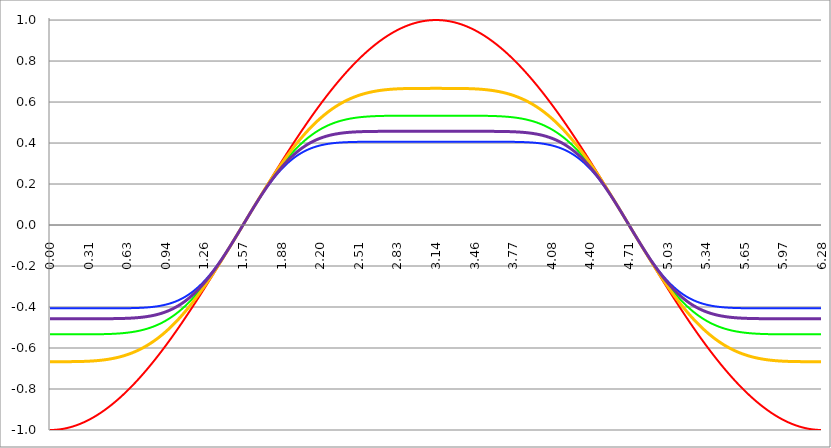
| Category | Series 1 | Series 0 | Series 2 | Series 3 | Series 4 |
|---|---|---|---|---|---|
| 0.0 | -1 | -0.533 | -0.406 | -0.667 | -0.457 |
| 0.00314159265358979 | -1 | -0.533 | -0.406 | -0.667 | -0.457 |
| 0.00628318530717958 | -1 | -0.533 | -0.406 | -0.667 | -0.457 |
| 0.00942477796076938 | -1 | -0.533 | -0.406 | -0.667 | -0.457 |
| 0.0125663706143592 | -1 | -0.533 | -0.406 | -0.667 | -0.457 |
| 0.015707963267949 | -1 | -0.533 | -0.406 | -0.667 | -0.457 |
| 0.0188495559215388 | -1 | -0.533 | -0.406 | -0.667 | -0.457 |
| 0.0219911485751285 | -1 | -0.533 | -0.406 | -0.667 | -0.457 |
| 0.0251327412287183 | -1 | -0.533 | -0.406 | -0.667 | -0.457 |
| 0.0282743338823081 | -1 | -0.533 | -0.406 | -0.667 | -0.457 |
| 0.0314159265358979 | -1 | -0.533 | -0.406 | -0.667 | -0.457 |
| 0.0345575191894877 | -0.999 | -0.533 | -0.406 | -0.667 | -0.457 |
| 0.0376991118430775 | -0.999 | -0.533 | -0.406 | -0.667 | -0.457 |
| 0.0408407044966673 | -0.999 | -0.533 | -0.406 | -0.667 | -0.457 |
| 0.0439822971502571 | -0.999 | -0.533 | -0.406 | -0.667 | -0.457 |
| 0.0471238898038469 | -0.999 | -0.533 | -0.406 | -0.667 | -0.457 |
| 0.0502654824574367 | -0.999 | -0.533 | -0.406 | -0.667 | -0.457 |
| 0.0534070751110265 | -0.999 | -0.533 | -0.406 | -0.667 | -0.457 |
| 0.0565486677646163 | -0.998 | -0.533 | -0.406 | -0.667 | -0.457 |
| 0.059690260418206 | -0.998 | -0.533 | -0.406 | -0.667 | -0.457 |
| 0.0628318530717958 | -0.998 | -0.533 | -0.406 | -0.667 | -0.457 |
| 0.0659734457253856 | -0.998 | -0.533 | -0.406 | -0.667 | -0.457 |
| 0.0691150383789754 | -0.998 | -0.533 | -0.406 | -0.667 | -0.457 |
| 0.0722566310325652 | -0.997 | -0.533 | -0.406 | -0.667 | -0.457 |
| 0.075398223686155 | -0.997 | -0.533 | -0.406 | -0.667 | -0.457 |
| 0.0785398163397448 | -0.997 | -0.533 | -0.406 | -0.667 | -0.457 |
| 0.0816814089933346 | -0.997 | -0.533 | -0.406 | -0.667 | -0.457 |
| 0.0848230016469244 | -0.996 | -0.533 | -0.406 | -0.667 | -0.457 |
| 0.0879645943005142 | -0.996 | -0.533 | -0.406 | -0.667 | -0.457 |
| 0.091106186954104 | -0.996 | -0.533 | -0.406 | -0.667 | -0.457 |
| 0.0942477796076937 | -0.996 | -0.533 | -0.406 | -0.667 | -0.457 |
| 0.0973893722612835 | -0.995 | -0.533 | -0.406 | -0.667 | -0.457 |
| 0.100530964914873 | -0.995 | -0.533 | -0.406 | -0.667 | -0.457 |
| 0.103672557568463 | -0.995 | -0.533 | -0.406 | -0.667 | -0.457 |
| 0.106814150222053 | -0.994 | -0.533 | -0.406 | -0.667 | -0.457 |
| 0.109955742875643 | -0.994 | -0.533 | -0.406 | -0.667 | -0.457 |
| 0.113097335529233 | -0.994 | -0.533 | -0.406 | -0.667 | -0.457 |
| 0.116238928182822 | -0.993 | -0.533 | -0.406 | -0.667 | -0.457 |
| 0.119380520836412 | -0.993 | -0.533 | -0.406 | -0.667 | -0.457 |
| 0.122522113490002 | -0.993 | -0.533 | -0.406 | -0.667 | -0.457 |
| 0.125663706143592 | -0.992 | -0.533 | -0.406 | -0.667 | -0.457 |
| 0.128805298797181 | -0.992 | -0.533 | -0.406 | -0.667 | -0.457 |
| 0.131946891450771 | -0.991 | -0.533 | -0.406 | -0.667 | -0.457 |
| 0.135088484104361 | -0.991 | -0.533 | -0.406 | -0.667 | -0.457 |
| 0.138230076757951 | -0.99 | -0.533 | -0.406 | -0.667 | -0.457 |
| 0.141371669411541 | -0.99 | -0.533 | -0.406 | -0.667 | -0.457 |
| 0.14451326206513 | -0.99 | -0.533 | -0.406 | -0.667 | -0.457 |
| 0.14765485471872 | -0.989 | -0.533 | -0.406 | -0.667 | -0.457 |
| 0.15079644737231 | -0.989 | -0.533 | -0.406 | -0.667 | -0.457 |
| 0.1539380400259 | -0.988 | -0.533 | -0.406 | -0.667 | -0.457 |
| 0.15707963267949 | -0.988 | -0.533 | -0.406 | -0.667 | -0.457 |
| 0.160221225333079 | -0.987 | -0.533 | -0.406 | -0.667 | -0.457 |
| 0.163362817986669 | -0.987 | -0.533 | -0.406 | -0.666 | -0.457 |
| 0.166504410640259 | -0.986 | -0.533 | -0.406 | -0.666 | -0.457 |
| 0.169646003293849 | -0.986 | -0.533 | -0.406 | -0.666 | -0.457 |
| 0.172787595947439 | -0.985 | -0.533 | -0.406 | -0.666 | -0.457 |
| 0.175929188601028 | -0.985 | -0.533 | -0.406 | -0.666 | -0.457 |
| 0.179070781254618 | -0.984 | -0.533 | -0.406 | -0.666 | -0.457 |
| 0.182212373908208 | -0.983 | -0.533 | -0.406 | -0.666 | -0.457 |
| 0.185353966561798 | -0.983 | -0.533 | -0.406 | -0.666 | -0.457 |
| 0.188495559215388 | -0.982 | -0.533 | -0.406 | -0.666 | -0.457 |
| 0.191637151868977 | -0.982 | -0.533 | -0.406 | -0.666 | -0.457 |
| 0.194778744522567 | -0.981 | -0.533 | -0.406 | -0.666 | -0.457 |
| 0.197920337176157 | -0.98 | -0.533 | -0.406 | -0.666 | -0.457 |
| 0.201061929829747 | -0.98 | -0.533 | -0.406 | -0.666 | -0.457 |
| 0.204203522483336 | -0.979 | -0.533 | -0.406 | -0.666 | -0.457 |
| 0.207345115136926 | -0.979 | -0.533 | -0.406 | -0.666 | -0.457 |
| 0.210486707790516 | -0.978 | -0.533 | -0.406 | -0.666 | -0.457 |
| 0.213628300444106 | -0.977 | -0.533 | -0.406 | -0.666 | -0.457 |
| 0.216769893097696 | -0.977 | -0.533 | -0.406 | -0.666 | -0.457 |
| 0.219911485751285 | -0.976 | -0.533 | -0.406 | -0.666 | -0.457 |
| 0.223053078404875 | -0.975 | -0.533 | -0.406 | -0.666 | -0.457 |
| 0.226194671058465 | -0.975 | -0.533 | -0.406 | -0.666 | -0.457 |
| 0.229336263712055 | -0.974 | -0.533 | -0.406 | -0.666 | -0.457 |
| 0.232477856365645 | -0.973 | -0.533 | -0.406 | -0.666 | -0.457 |
| 0.235619449019234 | -0.972 | -0.533 | -0.406 | -0.666 | -0.457 |
| 0.238761041672824 | -0.972 | -0.533 | -0.406 | -0.666 | -0.457 |
| 0.241902634326414 | -0.971 | -0.533 | -0.406 | -0.666 | -0.457 |
| 0.245044226980004 | -0.97 | -0.533 | -0.406 | -0.666 | -0.457 |
| 0.248185819633594 | -0.969 | -0.533 | -0.406 | -0.666 | -0.457 |
| 0.251327412287183 | -0.969 | -0.533 | -0.406 | -0.666 | -0.457 |
| 0.254469004940773 | -0.968 | -0.533 | -0.406 | -0.666 | -0.457 |
| 0.257610597594363 | -0.967 | -0.533 | -0.406 | -0.666 | -0.457 |
| 0.260752190247953 | -0.966 | -0.533 | -0.406 | -0.666 | -0.457 |
| 0.263893782901543 | -0.965 | -0.533 | -0.406 | -0.665 | -0.457 |
| 0.267035375555132 | -0.965 | -0.533 | -0.406 | -0.665 | -0.457 |
| 0.270176968208722 | -0.964 | -0.533 | -0.406 | -0.665 | -0.457 |
| 0.273318560862312 | -0.963 | -0.533 | -0.406 | -0.665 | -0.457 |
| 0.276460153515902 | -0.962 | -0.533 | -0.406 | -0.665 | -0.457 |
| 0.279601746169492 | -0.961 | -0.533 | -0.406 | -0.665 | -0.457 |
| 0.282743338823082 | -0.96 | -0.533 | -0.406 | -0.665 | -0.457 |
| 0.285884931476671 | -0.959 | -0.533 | -0.406 | -0.665 | -0.457 |
| 0.289026524130261 | -0.959 | -0.533 | -0.406 | -0.665 | -0.457 |
| 0.292168116783851 | -0.958 | -0.533 | -0.406 | -0.665 | -0.457 |
| 0.295309709437441 | -0.957 | -0.533 | -0.406 | -0.665 | -0.457 |
| 0.298451302091031 | -0.956 | -0.533 | -0.406 | -0.665 | -0.457 |
| 0.30159289474462 | -0.955 | -0.533 | -0.406 | -0.665 | -0.457 |
| 0.30473448739821 | -0.954 | -0.533 | -0.406 | -0.665 | -0.457 |
| 0.3078760800518 | -0.953 | -0.533 | -0.406 | -0.664 | -0.457 |
| 0.31101767270539 | -0.952 | -0.533 | -0.406 | -0.664 | -0.457 |
| 0.31415926535898 | -0.951 | -0.533 | -0.406 | -0.664 | -0.457 |
| 0.31730085801257 | -0.95 | -0.533 | -0.406 | -0.664 | -0.457 |
| 0.320442450666159 | -0.949 | -0.533 | -0.406 | -0.664 | -0.457 |
| 0.323584043319749 | -0.948 | -0.533 | -0.406 | -0.664 | -0.457 |
| 0.326725635973339 | -0.947 | -0.533 | -0.406 | -0.664 | -0.457 |
| 0.329867228626929 | -0.946 | -0.533 | -0.406 | -0.664 | -0.457 |
| 0.333008821280519 | -0.945 | -0.533 | -0.406 | -0.664 | -0.457 |
| 0.336150413934108 | -0.944 | -0.533 | -0.406 | -0.664 | -0.457 |
| 0.339292006587698 | -0.943 | -0.533 | -0.406 | -0.663 | -0.457 |
| 0.342433599241288 | -0.942 | -0.533 | -0.406 | -0.663 | -0.457 |
| 0.345575191894878 | -0.941 | -0.533 | -0.406 | -0.663 | -0.457 |
| 0.348716784548468 | -0.94 | -0.533 | -0.406 | -0.663 | -0.457 |
| 0.351858377202058 | -0.939 | -0.533 | -0.406 | -0.663 | -0.457 |
| 0.354999969855647 | -0.938 | -0.533 | -0.406 | -0.663 | -0.457 |
| 0.358141562509237 | -0.937 | -0.533 | -0.406 | -0.663 | -0.457 |
| 0.361283155162827 | -0.935 | -0.533 | -0.406 | -0.663 | -0.457 |
| 0.364424747816417 | -0.934 | -0.533 | -0.406 | -0.662 | -0.457 |
| 0.367566340470007 | -0.933 | -0.533 | -0.406 | -0.662 | -0.457 |
| 0.370707933123597 | -0.932 | -0.533 | -0.406 | -0.662 | -0.457 |
| 0.373849525777186 | -0.931 | -0.533 | -0.406 | -0.662 | -0.457 |
| 0.376991118430776 | -0.93 | -0.533 | -0.406 | -0.662 | -0.457 |
| 0.380132711084366 | -0.929 | -0.533 | -0.406 | -0.662 | -0.457 |
| 0.383274303737956 | -0.927 | -0.533 | -0.406 | -0.662 | -0.457 |
| 0.386415896391546 | -0.926 | -0.533 | -0.406 | -0.661 | -0.457 |
| 0.389557489045135 | -0.925 | -0.533 | -0.406 | -0.661 | -0.457 |
| 0.392699081698725 | -0.924 | -0.533 | -0.406 | -0.661 | -0.457 |
| 0.395840674352315 | -0.923 | -0.533 | -0.406 | -0.661 | -0.457 |
| 0.398982267005905 | -0.921 | -0.533 | -0.406 | -0.661 | -0.457 |
| 0.402123859659495 | -0.92 | -0.533 | -0.406 | -0.66 | -0.457 |
| 0.405265452313085 | -0.919 | -0.533 | -0.406 | -0.66 | -0.457 |
| 0.408407044966674 | -0.918 | -0.533 | -0.406 | -0.66 | -0.457 |
| 0.411548637620264 | -0.917 | -0.533 | -0.406 | -0.66 | -0.457 |
| 0.414690230273854 | -0.915 | -0.533 | -0.406 | -0.66 | -0.457 |
| 0.417831822927444 | -0.914 | -0.533 | -0.406 | -0.659 | -0.457 |
| 0.420973415581034 | -0.913 | -0.533 | -0.406 | -0.659 | -0.457 |
| 0.424115008234623 | -0.911 | -0.532 | -0.406 | -0.659 | -0.457 |
| 0.427256600888213 | -0.91 | -0.532 | -0.406 | -0.659 | -0.457 |
| 0.430398193541803 | -0.909 | -0.532 | -0.406 | -0.659 | -0.457 |
| 0.433539786195393 | -0.907 | -0.532 | -0.406 | -0.658 | -0.457 |
| 0.436681378848983 | -0.906 | -0.532 | -0.406 | -0.658 | -0.457 |
| 0.439822971502573 | -0.905 | -0.532 | -0.406 | -0.658 | -0.457 |
| 0.442964564156162 | -0.903 | -0.532 | -0.406 | -0.658 | -0.457 |
| 0.446106156809752 | -0.902 | -0.532 | -0.406 | -0.657 | -0.457 |
| 0.449247749463342 | -0.901 | -0.532 | -0.406 | -0.657 | -0.457 |
| 0.452389342116932 | -0.899 | -0.532 | -0.406 | -0.657 | -0.457 |
| 0.455530934770522 | -0.898 | -0.532 | -0.406 | -0.657 | -0.457 |
| 0.458672527424111 | -0.897 | -0.532 | -0.406 | -0.656 | -0.457 |
| 0.461814120077701 | -0.895 | -0.532 | -0.406 | -0.656 | -0.457 |
| 0.464955712731291 | -0.894 | -0.532 | -0.406 | -0.656 | -0.457 |
| 0.468097305384881 | -0.892 | -0.532 | -0.406 | -0.656 | -0.457 |
| 0.471238898038471 | -0.891 | -0.532 | -0.406 | -0.655 | -0.457 |
| 0.474380490692061 | -0.89 | -0.532 | -0.406 | -0.655 | -0.457 |
| 0.47752208334565 | -0.888 | -0.532 | -0.406 | -0.655 | -0.457 |
| 0.48066367599924 | -0.887 | -0.532 | -0.406 | -0.654 | -0.457 |
| 0.48380526865283 | -0.885 | -0.531 | -0.406 | -0.654 | -0.457 |
| 0.48694686130642 | -0.884 | -0.531 | -0.406 | -0.654 | -0.457 |
| 0.49008845396001 | -0.882 | -0.531 | -0.406 | -0.653 | -0.457 |
| 0.493230046613599 | -0.881 | -0.531 | -0.406 | -0.653 | -0.457 |
| 0.496371639267189 | -0.879 | -0.531 | -0.406 | -0.653 | -0.457 |
| 0.499513231920779 | -0.878 | -0.531 | -0.406 | -0.652 | -0.457 |
| 0.502654824574369 | -0.876 | -0.531 | -0.406 | -0.652 | -0.457 |
| 0.505796417227959 | -0.875 | -0.531 | -0.406 | -0.652 | -0.457 |
| 0.508938009881549 | -0.873 | -0.531 | -0.406 | -0.651 | -0.457 |
| 0.512079602535138 | -0.872 | -0.531 | -0.406 | -0.651 | -0.457 |
| 0.515221195188728 | -0.87 | -0.531 | -0.406 | -0.651 | -0.457 |
| 0.518362787842318 | -0.869 | -0.531 | -0.406 | -0.65 | -0.457 |
| 0.521504380495908 | -0.867 | -0.531 | -0.406 | -0.65 | -0.457 |
| 0.524645973149498 | -0.866 | -0.53 | -0.406 | -0.649 | -0.457 |
| 0.527787565803087 | -0.864 | -0.53 | -0.406 | -0.649 | -0.457 |
| 0.530929158456677 | -0.862 | -0.53 | -0.406 | -0.649 | -0.457 |
| 0.534070751110267 | -0.861 | -0.53 | -0.406 | -0.648 | -0.457 |
| 0.537212343763857 | -0.859 | -0.53 | -0.406 | -0.648 | -0.456 |
| 0.540353936417447 | -0.858 | -0.53 | -0.406 | -0.647 | -0.456 |
| 0.543495529071037 | -0.856 | -0.53 | -0.406 | -0.647 | -0.456 |
| 0.546637121724626 | -0.854 | -0.53 | -0.406 | -0.646 | -0.456 |
| 0.549778714378216 | -0.853 | -0.53 | -0.406 | -0.646 | -0.456 |
| 0.552920307031806 | -0.851 | -0.529 | -0.406 | -0.646 | -0.456 |
| 0.556061899685396 | -0.849 | -0.529 | -0.406 | -0.645 | -0.456 |
| 0.559203492338986 | -0.848 | -0.529 | -0.406 | -0.645 | -0.456 |
| 0.562345084992576 | -0.846 | -0.529 | -0.406 | -0.644 | -0.456 |
| 0.565486677646165 | -0.844 | -0.529 | -0.406 | -0.644 | -0.456 |
| 0.568628270299755 | -0.843 | -0.529 | -0.406 | -0.643 | -0.456 |
| 0.571769862953345 | -0.841 | -0.529 | -0.406 | -0.643 | -0.456 |
| 0.574911455606935 | -0.839 | -0.528 | -0.406 | -0.642 | -0.456 |
| 0.578053048260525 | -0.838 | -0.528 | -0.406 | -0.642 | -0.456 |
| 0.581194640914114 | -0.836 | -0.528 | -0.406 | -0.641 | -0.456 |
| 0.584336233567704 | -0.834 | -0.528 | -0.406 | -0.641 | -0.456 |
| 0.587477826221294 | -0.832 | -0.528 | -0.406 | -0.64 | -0.456 |
| 0.590619418874884 | -0.831 | -0.528 | -0.406 | -0.64 | -0.456 |
| 0.593761011528474 | -0.829 | -0.527 | -0.406 | -0.639 | -0.456 |
| 0.596902604182064 | -0.827 | -0.527 | -0.406 | -0.638 | -0.456 |
| 0.600044196835653 | -0.825 | -0.527 | -0.406 | -0.638 | -0.456 |
| 0.603185789489243 | -0.824 | -0.527 | -0.406 | -0.637 | -0.456 |
| 0.606327382142833 | -0.822 | -0.527 | -0.406 | -0.637 | -0.456 |
| 0.609468974796423 | -0.82 | -0.527 | -0.406 | -0.636 | -0.455 |
| 0.612610567450013 | -0.818 | -0.526 | -0.406 | -0.636 | -0.455 |
| 0.615752160103602 | -0.816 | -0.526 | -0.406 | -0.635 | -0.455 |
| 0.618893752757192 | -0.815 | -0.526 | -0.406 | -0.634 | -0.455 |
| 0.622035345410782 | -0.813 | -0.526 | -0.406 | -0.634 | -0.455 |
| 0.625176938064372 | -0.811 | -0.526 | -0.406 | -0.633 | -0.455 |
| 0.628318530717962 | -0.809 | -0.525 | -0.406 | -0.633 | -0.455 |
| 0.631460123371551 | -0.807 | -0.525 | -0.406 | -0.632 | -0.455 |
| 0.634601716025141 | -0.805 | -0.525 | -0.406 | -0.631 | -0.455 |
| 0.637743308678731 | -0.803 | -0.525 | -0.406 | -0.631 | -0.455 |
| 0.640884901332321 | -0.802 | -0.524 | -0.406 | -0.63 | -0.455 |
| 0.644026493985911 | -0.8 | -0.524 | -0.406 | -0.629 | -0.455 |
| 0.647168086639501 | -0.798 | -0.524 | -0.406 | -0.629 | -0.455 |
| 0.65030967929309 | -0.796 | -0.524 | -0.406 | -0.628 | -0.454 |
| 0.65345127194668 | -0.794 | -0.523 | -0.406 | -0.627 | -0.454 |
| 0.65659286460027 | -0.792 | -0.523 | -0.405 | -0.626 | -0.454 |
| 0.65973445725386 | -0.79 | -0.523 | -0.405 | -0.626 | -0.454 |
| 0.66287604990745 | -0.788 | -0.523 | -0.405 | -0.625 | -0.454 |
| 0.666017642561039 | -0.786 | -0.522 | -0.405 | -0.624 | -0.454 |
| 0.669159235214629 | -0.784 | -0.522 | -0.405 | -0.624 | -0.454 |
| 0.672300827868219 | -0.782 | -0.522 | -0.405 | -0.623 | -0.454 |
| 0.675442420521809 | -0.78 | -0.521 | -0.405 | -0.622 | -0.454 |
| 0.678584013175399 | -0.778 | -0.521 | -0.405 | -0.621 | -0.453 |
| 0.681725605828989 | -0.776 | -0.521 | -0.405 | -0.62 | -0.453 |
| 0.684867198482578 | -0.775 | -0.521 | -0.405 | -0.62 | -0.453 |
| 0.688008791136168 | -0.773 | -0.52 | -0.405 | -0.619 | -0.453 |
| 0.691150383789758 | -0.771 | -0.52 | -0.405 | -0.618 | -0.453 |
| 0.694291976443348 | -0.769 | -0.52 | -0.405 | -0.617 | -0.453 |
| 0.697433569096938 | -0.766 | -0.519 | -0.405 | -0.616 | -0.453 |
| 0.700575161750528 | -0.764 | -0.519 | -0.405 | -0.616 | -0.453 |
| 0.703716754404117 | -0.762 | -0.518 | -0.405 | -0.615 | -0.452 |
| 0.706858347057707 | -0.76 | -0.518 | -0.405 | -0.614 | -0.452 |
| 0.709999939711297 | -0.758 | -0.518 | -0.405 | -0.613 | -0.452 |
| 0.713141532364887 | -0.756 | -0.517 | -0.405 | -0.612 | -0.452 |
| 0.716283125018477 | -0.754 | -0.517 | -0.404 | -0.611 | -0.452 |
| 0.719424717672066 | -0.752 | -0.517 | -0.404 | -0.61 | -0.452 |
| 0.722566310325656 | -0.75 | -0.516 | -0.404 | -0.609 | -0.451 |
| 0.725707902979246 | -0.748 | -0.516 | -0.404 | -0.609 | -0.451 |
| 0.728849495632836 | -0.746 | -0.515 | -0.404 | -0.608 | -0.451 |
| 0.731991088286426 | -0.744 | -0.515 | -0.404 | -0.607 | -0.451 |
| 0.735132680940016 | -0.742 | -0.515 | -0.404 | -0.606 | -0.451 |
| 0.738274273593605 | -0.74 | -0.514 | -0.404 | -0.605 | -0.451 |
| 0.741415866247195 | -0.738 | -0.514 | -0.404 | -0.604 | -0.45 |
| 0.744557458900785 | -0.735 | -0.513 | -0.404 | -0.603 | -0.45 |
| 0.747699051554375 | -0.733 | -0.513 | -0.404 | -0.602 | -0.45 |
| 0.750840644207965 | -0.731 | -0.512 | -0.404 | -0.601 | -0.45 |
| 0.753982236861554 | -0.729 | -0.512 | -0.403 | -0.6 | -0.449 |
| 0.757123829515144 | -0.727 | -0.511 | -0.403 | -0.599 | -0.449 |
| 0.760265422168734 | -0.725 | -0.511 | -0.403 | -0.598 | -0.449 |
| 0.763407014822324 | -0.722 | -0.51 | -0.403 | -0.597 | -0.449 |
| 0.766548607475914 | -0.72 | -0.51 | -0.403 | -0.596 | -0.449 |
| 0.769690200129504 | -0.718 | -0.509 | -0.403 | -0.595 | -0.448 |
| 0.772831792783093 | -0.716 | -0.509 | -0.403 | -0.594 | -0.448 |
| 0.775973385436683 | -0.714 | -0.508 | -0.403 | -0.593 | -0.448 |
| 0.779114978090273 | -0.712 | -0.508 | -0.403 | -0.591 | -0.448 |
| 0.782256570743863 | -0.709 | -0.507 | -0.402 | -0.59 | -0.447 |
| 0.785398163397453 | -0.707 | -0.507 | -0.402 | -0.589 | -0.447 |
| 0.788539756051042 | -0.705 | -0.506 | -0.402 | -0.588 | -0.447 |
| 0.791681348704632 | -0.703 | -0.506 | -0.402 | -0.587 | -0.446 |
| 0.794822941358222 | -0.7 | -0.505 | -0.402 | -0.586 | -0.446 |
| 0.797964534011812 | -0.698 | -0.504 | -0.402 | -0.585 | -0.446 |
| 0.801106126665402 | -0.696 | -0.504 | -0.401 | -0.584 | -0.446 |
| 0.804247719318992 | -0.694 | -0.503 | -0.401 | -0.582 | -0.445 |
| 0.807389311972581 | -0.691 | -0.503 | -0.401 | -0.581 | -0.445 |
| 0.810530904626171 | -0.689 | -0.502 | -0.401 | -0.58 | -0.445 |
| 0.813672497279761 | -0.687 | -0.501 | -0.401 | -0.579 | -0.444 |
| 0.816814089933351 | -0.685 | -0.501 | -0.401 | -0.578 | -0.444 |
| 0.819955682586941 | -0.682 | -0.5 | -0.4 | -0.576 | -0.444 |
| 0.823097275240531 | -0.68 | -0.499 | -0.4 | -0.575 | -0.443 |
| 0.82623886789412 | -0.678 | -0.499 | -0.4 | -0.574 | -0.443 |
| 0.82938046054771 | -0.675 | -0.498 | -0.4 | -0.573 | -0.442 |
| 0.8325220532013 | -0.673 | -0.497 | -0.4 | -0.571 | -0.442 |
| 0.83566364585489 | -0.671 | -0.497 | -0.399 | -0.57 | -0.442 |
| 0.83880523850848 | -0.668 | -0.496 | -0.399 | -0.569 | -0.441 |
| 0.841946831162069 | -0.666 | -0.495 | -0.399 | -0.568 | -0.441 |
| 0.845088423815659 | -0.664 | -0.495 | -0.399 | -0.566 | -0.441 |
| 0.848230016469249 | -0.661 | -0.494 | -0.399 | -0.565 | -0.44 |
| 0.851371609122839 | -0.659 | -0.493 | -0.398 | -0.564 | -0.44 |
| 0.854513201776429 | -0.657 | -0.492 | -0.398 | -0.562 | -0.439 |
| 0.857654794430019 | -0.654 | -0.492 | -0.398 | -0.561 | -0.439 |
| 0.860796387083608 | -0.652 | -0.491 | -0.398 | -0.56 | -0.438 |
| 0.863937979737198 | -0.649 | -0.49 | -0.397 | -0.558 | -0.438 |
| 0.867079572390788 | -0.647 | -0.489 | -0.397 | -0.557 | -0.437 |
| 0.870221165044378 | -0.645 | -0.488 | -0.397 | -0.555 | -0.437 |
| 0.873362757697968 | -0.642 | -0.487 | -0.396 | -0.554 | -0.436 |
| 0.876504350351557 | -0.64 | -0.487 | -0.396 | -0.553 | -0.436 |
| 0.879645943005147 | -0.637 | -0.486 | -0.396 | -0.551 | -0.435 |
| 0.882787535658737 | -0.635 | -0.485 | -0.396 | -0.55 | -0.435 |
| 0.885929128312327 | -0.633 | -0.484 | -0.395 | -0.548 | -0.434 |
| 0.889070720965917 | -0.63 | -0.483 | -0.395 | -0.547 | -0.434 |
| 0.892212313619507 | -0.628 | -0.482 | -0.395 | -0.545 | -0.433 |
| 0.895353906273096 | -0.625 | -0.481 | -0.394 | -0.544 | -0.433 |
| 0.898495498926686 | -0.623 | -0.48 | -0.394 | -0.542 | -0.432 |
| 0.901637091580276 | -0.62 | -0.48 | -0.394 | -0.541 | -0.432 |
| 0.904778684233866 | -0.618 | -0.479 | -0.393 | -0.539 | -0.431 |
| 0.907920276887456 | -0.615 | -0.478 | -0.393 | -0.538 | -0.431 |
| 0.911061869541045 | -0.613 | -0.477 | -0.392 | -0.536 | -0.43 |
| 0.914203462194635 | -0.61 | -0.476 | -0.392 | -0.535 | -0.429 |
| 0.917345054848225 | -0.608 | -0.475 | -0.392 | -0.533 | -0.429 |
| 0.920486647501815 | -0.605 | -0.474 | -0.391 | -0.531 | -0.428 |
| 0.923628240155405 | -0.603 | -0.473 | -0.391 | -0.53 | -0.427 |
| 0.926769832808995 | -0.6 | -0.472 | -0.391 | -0.528 | -0.427 |
| 0.929911425462584 | -0.598 | -0.471 | -0.39 | -0.527 | -0.426 |
| 0.933053018116174 | -0.595 | -0.47 | -0.39 | -0.525 | -0.425 |
| 0.936194610769764 | -0.593 | -0.469 | -0.389 | -0.523 | -0.425 |
| 0.939336203423354 | -0.59 | -0.468 | -0.389 | -0.522 | -0.424 |
| 0.942477796076944 | -0.588 | -0.466 | -0.388 | -0.52 | -0.423 |
| 0.945619388730533 | -0.585 | -0.465 | -0.388 | -0.518 | -0.423 |
| 0.948760981384123 | -0.583 | -0.464 | -0.387 | -0.517 | -0.422 |
| 0.951902574037713 | -0.58 | -0.463 | -0.387 | -0.515 | -0.421 |
| 0.955044166691303 | -0.578 | -0.462 | -0.386 | -0.513 | -0.42 |
| 0.958185759344893 | -0.575 | -0.461 | -0.386 | -0.512 | -0.42 |
| 0.961327351998483 | -0.572 | -0.46 | -0.385 | -0.51 | -0.419 |
| 0.964468944652072 | -0.57 | -0.459 | -0.385 | -0.508 | -0.418 |
| 0.967610537305662 | -0.567 | -0.457 | -0.384 | -0.506 | -0.417 |
| 0.970752129959252 | -0.565 | -0.456 | -0.384 | -0.505 | -0.416 |
| 0.973893722612842 | -0.562 | -0.455 | -0.383 | -0.503 | -0.416 |
| 0.977035315266432 | -0.559 | -0.454 | -0.383 | -0.501 | -0.415 |
| 0.980176907920022 | -0.557 | -0.452 | -0.382 | -0.499 | -0.414 |
| 0.983318500573611 | -0.554 | -0.451 | -0.381 | -0.498 | -0.413 |
| 0.986460093227201 | -0.552 | -0.45 | -0.381 | -0.496 | -0.412 |
| 0.989601685880791 | -0.549 | -0.449 | -0.38 | -0.494 | -0.411 |
| 0.992743278534381 | -0.546 | -0.447 | -0.38 | -0.492 | -0.41 |
| 0.995884871187971 | -0.544 | -0.446 | -0.379 | -0.49 | -0.409 |
| 0.99902646384156 | -0.541 | -0.445 | -0.378 | -0.488 | -0.409 |
| 1.00216805649515 | -0.538 | -0.443 | -0.378 | -0.486 | -0.408 |
| 1.00530964914874 | -0.536 | -0.442 | -0.377 | -0.485 | -0.407 |
| 1.00845124180233 | -0.533 | -0.441 | -0.376 | -0.483 | -0.406 |
| 1.01159283445592 | -0.531 | -0.439 | -0.375 | -0.481 | -0.405 |
| 1.01473442710951 | -0.528 | -0.438 | -0.375 | -0.479 | -0.404 |
| 1.017876019763099 | -0.525 | -0.437 | -0.374 | -0.477 | -0.403 |
| 1.021017612416689 | -0.522 | -0.435 | -0.373 | -0.475 | -0.402 |
| 1.02415920507028 | -0.52 | -0.434 | -0.373 | -0.473 | -0.401 |
| 1.027300797723869 | -0.517 | -0.432 | -0.372 | -0.471 | -0.4 |
| 1.030442390377459 | -0.514 | -0.431 | -0.371 | -0.469 | -0.399 |
| 1.033583983031048 | -0.512 | -0.429 | -0.37 | -0.467 | -0.397 |
| 1.036725575684638 | -0.509 | -0.428 | -0.369 | -0.465 | -0.396 |
| 1.039867168338228 | -0.506 | -0.426 | -0.369 | -0.463 | -0.395 |
| 1.043008760991818 | -0.504 | -0.425 | -0.368 | -0.461 | -0.394 |
| 1.046150353645408 | -0.501 | -0.423 | -0.367 | -0.459 | -0.393 |
| 1.049291946298998 | -0.498 | -0.422 | -0.366 | -0.457 | -0.392 |
| 1.052433538952587 | -0.495 | -0.42 | -0.365 | -0.455 | -0.391 |
| 1.055575131606177 | -0.493 | -0.419 | -0.364 | -0.453 | -0.39 |
| 1.058716724259767 | -0.49 | -0.417 | -0.363 | -0.451 | -0.388 |
| 1.061858316913357 | -0.487 | -0.416 | -0.362 | -0.449 | -0.387 |
| 1.064999909566947 | -0.485 | -0.414 | -0.361 | -0.447 | -0.386 |
| 1.068141502220536 | -0.482 | -0.412 | -0.361 | -0.444 | -0.385 |
| 1.071283094874126 | -0.479 | -0.411 | -0.36 | -0.442 | -0.383 |
| 1.074424687527716 | -0.476 | -0.409 | -0.359 | -0.44 | -0.382 |
| 1.077566280181306 | -0.473 | -0.407 | -0.358 | -0.438 | -0.381 |
| 1.080707872834896 | -0.471 | -0.406 | -0.357 | -0.436 | -0.38 |
| 1.083849465488486 | -0.468 | -0.404 | -0.356 | -0.434 | -0.378 |
| 1.086991058142075 | -0.465 | -0.402 | -0.355 | -0.432 | -0.377 |
| 1.090132650795665 | -0.462 | -0.401 | -0.353 | -0.429 | -0.376 |
| 1.093274243449255 | -0.46 | -0.399 | -0.352 | -0.427 | -0.374 |
| 1.096415836102845 | -0.457 | -0.397 | -0.351 | -0.425 | -0.373 |
| 1.099557428756435 | -0.454 | -0.395 | -0.35 | -0.423 | -0.371 |
| 1.102699021410025 | -0.451 | -0.394 | -0.349 | -0.421 | -0.37 |
| 1.105840614063614 | -0.448 | -0.392 | -0.348 | -0.418 | -0.369 |
| 1.108982206717204 | -0.446 | -0.39 | -0.347 | -0.416 | -0.367 |
| 1.112123799370794 | -0.443 | -0.388 | -0.346 | -0.414 | -0.366 |
| 1.115265392024384 | -0.44 | -0.386 | -0.344 | -0.412 | -0.364 |
| 1.118406984677974 | -0.437 | -0.385 | -0.343 | -0.409 | -0.363 |
| 1.121548577331563 | -0.434 | -0.383 | -0.342 | -0.407 | -0.361 |
| 1.124690169985153 | -0.431 | -0.381 | -0.341 | -0.405 | -0.36 |
| 1.127831762638743 | -0.429 | -0.379 | -0.34 | -0.402 | -0.358 |
| 1.130973355292333 | -0.426 | -0.377 | -0.338 | -0.4 | -0.357 |
| 1.134114947945923 | -0.423 | -0.375 | -0.337 | -0.398 | -0.355 |
| 1.137256540599513 | -0.42 | -0.373 | -0.336 | -0.395 | -0.353 |
| 1.140398133253102 | -0.417 | -0.371 | -0.334 | -0.393 | -0.352 |
| 1.143539725906692 | -0.414 | -0.369 | -0.333 | -0.391 | -0.35 |
| 1.146681318560282 | -0.412 | -0.367 | -0.332 | -0.388 | -0.349 |
| 1.149822911213872 | -0.409 | -0.365 | -0.33 | -0.386 | -0.347 |
| 1.152964503867462 | -0.406 | -0.363 | -0.329 | -0.384 | -0.345 |
| 1.156106096521051 | -0.403 | -0.361 | -0.327 | -0.381 | -0.344 |
| 1.159247689174641 | -0.4 | -0.359 | -0.326 | -0.379 | -0.342 |
| 1.162389281828231 | -0.397 | -0.357 | -0.325 | -0.376 | -0.34 |
| 1.165530874481821 | -0.394 | -0.355 | -0.323 | -0.374 | -0.338 |
| 1.168672467135411 | -0.391 | -0.353 | -0.322 | -0.371 | -0.337 |
| 1.171814059789001 | -0.388 | -0.351 | -0.32 | -0.369 | -0.335 |
| 1.17495565244259 | -0.386 | -0.349 | -0.319 | -0.366 | -0.333 |
| 1.17809724509618 | -0.383 | -0.347 | -0.317 | -0.364 | -0.331 |
| 1.18123883774977 | -0.38 | -0.345 | -0.316 | -0.362 | -0.33 |
| 1.18438043040336 | -0.377 | -0.343 | -0.314 | -0.359 | -0.328 |
| 1.18752202305695 | -0.374 | -0.341 | -0.312 | -0.357 | -0.326 |
| 1.190663615710539 | -0.371 | -0.338 | -0.311 | -0.354 | -0.324 |
| 1.193805208364129 | -0.368 | -0.336 | -0.309 | -0.351 | -0.322 |
| 1.19694680101772 | -0.365 | -0.334 | -0.308 | -0.349 | -0.32 |
| 1.200088393671309 | -0.362 | -0.332 | -0.306 | -0.346 | -0.318 |
| 1.203229986324899 | -0.359 | -0.33 | -0.304 | -0.344 | -0.316 |
| 1.206371578978489 | -0.356 | -0.327 | -0.303 | -0.341 | -0.314 |
| 1.209513171632078 | -0.353 | -0.325 | -0.301 | -0.339 | -0.313 |
| 1.212654764285668 | -0.351 | -0.323 | -0.299 | -0.336 | -0.311 |
| 1.215796356939258 | -0.348 | -0.321 | -0.297 | -0.334 | -0.309 |
| 1.218937949592848 | -0.345 | -0.318 | -0.296 | -0.331 | -0.307 |
| 1.222079542246438 | -0.342 | -0.316 | -0.294 | -0.328 | -0.305 |
| 1.225221134900027 | -0.339 | -0.314 | -0.292 | -0.326 | -0.302 |
| 1.228362727553617 | -0.336 | -0.311 | -0.29 | -0.323 | -0.3 |
| 1.231504320207207 | -0.333 | -0.309 | -0.288 | -0.321 | -0.298 |
| 1.234645912860797 | -0.33 | -0.307 | -0.286 | -0.318 | -0.296 |
| 1.237787505514387 | -0.327 | -0.304 | -0.285 | -0.315 | -0.294 |
| 1.240929098167977 | -0.324 | -0.302 | -0.283 | -0.313 | -0.292 |
| 1.244070690821566 | -0.321 | -0.3 | -0.281 | -0.31 | -0.29 |
| 1.247212283475156 | -0.318 | -0.297 | -0.279 | -0.307 | -0.288 |
| 1.250353876128746 | -0.315 | -0.295 | -0.277 | -0.305 | -0.286 |
| 1.253495468782336 | -0.312 | -0.292 | -0.275 | -0.302 | -0.283 |
| 1.256637061435926 | -0.309 | -0.29 | -0.273 | -0.299 | -0.281 |
| 1.259778654089515 | -0.306 | -0.287 | -0.271 | -0.296 | -0.279 |
| 1.262920246743105 | -0.303 | -0.285 | -0.269 | -0.294 | -0.277 |
| 1.266061839396695 | -0.3 | -0.283 | -0.267 | -0.291 | -0.274 |
| 1.269203432050285 | -0.297 | -0.28 | -0.265 | -0.288 | -0.272 |
| 1.272345024703875 | -0.294 | -0.278 | -0.263 | -0.286 | -0.27 |
| 1.275486617357465 | -0.291 | -0.275 | -0.261 | -0.283 | -0.268 |
| 1.278628210011054 | -0.288 | -0.272 | -0.258 | -0.28 | -0.265 |
| 1.281769802664644 | -0.285 | -0.27 | -0.256 | -0.277 | -0.263 |
| 1.284911395318234 | -0.282 | -0.267 | -0.254 | -0.275 | -0.261 |
| 1.288052987971824 | -0.279 | -0.265 | -0.252 | -0.272 | -0.258 |
| 1.291194580625414 | -0.276 | -0.262 | -0.25 | -0.269 | -0.256 |
| 1.294336173279003 | -0.273 | -0.26 | -0.248 | -0.266 | -0.254 |
| 1.297477765932593 | -0.27 | -0.257 | -0.245 | -0.263 | -0.251 |
| 1.300619358586183 | -0.267 | -0.254 | -0.243 | -0.261 | -0.249 |
| 1.303760951239773 | -0.264 | -0.252 | -0.241 | -0.258 | -0.246 |
| 1.306902543893363 | -0.261 | -0.249 | -0.239 | -0.255 | -0.244 |
| 1.310044136546953 | -0.258 | -0.247 | -0.236 | -0.252 | -0.241 |
| 1.313185729200542 | -0.255 | -0.244 | -0.234 | -0.249 | -0.239 |
| 1.316327321854132 | -0.252 | -0.241 | -0.232 | -0.246 | -0.236 |
| 1.319468914507722 | -0.249 | -0.239 | -0.229 | -0.244 | -0.234 |
| 1.322610507161312 | -0.246 | -0.236 | -0.227 | -0.241 | -0.231 |
| 1.325752099814902 | -0.243 | -0.233 | -0.225 | -0.238 | -0.229 |
| 1.328893692468491 | -0.24 | -0.231 | -0.222 | -0.235 | -0.226 |
| 1.332035285122081 | -0.236 | -0.228 | -0.22 | -0.232 | -0.224 |
| 1.335176877775671 | -0.233 | -0.225 | -0.217 | -0.229 | -0.221 |
| 1.338318470429261 | -0.23 | -0.222 | -0.215 | -0.226 | -0.219 |
| 1.341460063082851 | -0.227 | -0.22 | -0.212 | -0.223 | -0.216 |
| 1.344601655736441 | -0.224 | -0.217 | -0.21 | -0.221 | -0.213 |
| 1.34774324839003 | -0.221 | -0.214 | -0.207 | -0.218 | -0.211 |
| 1.35088484104362 | -0.218 | -0.211 | -0.205 | -0.215 | -0.208 |
| 1.35402643369721 | -0.215 | -0.209 | -0.202 | -0.212 | -0.205 |
| 1.3571680263508 | -0.212 | -0.206 | -0.2 | -0.209 | -0.203 |
| 1.36030961900439 | -0.209 | -0.203 | -0.197 | -0.206 | -0.2 |
| 1.363451211657979 | -0.206 | -0.2 | -0.195 | -0.203 | -0.197 |
| 1.36659280431157 | -0.203 | -0.197 | -0.192 | -0.2 | -0.195 |
| 1.369734396965159 | -0.2 | -0.194 | -0.189 | -0.197 | -0.192 |
| 1.372875989618749 | -0.197 | -0.192 | -0.187 | -0.194 | -0.189 |
| 1.376017582272339 | -0.194 | -0.189 | -0.184 | -0.191 | -0.186 |
| 1.379159174925929 | -0.19 | -0.186 | -0.182 | -0.188 | -0.184 |
| 1.382300767579518 | -0.187 | -0.183 | -0.179 | -0.185 | -0.181 |
| 1.385442360233108 | -0.184 | -0.18 | -0.176 | -0.182 | -0.178 |
| 1.388583952886698 | -0.181 | -0.177 | -0.174 | -0.179 | -0.175 |
| 1.391725545540288 | -0.178 | -0.174 | -0.171 | -0.176 | -0.173 |
| 1.394867138193878 | -0.175 | -0.171 | -0.168 | -0.173 | -0.17 |
| 1.398008730847468 | -0.172 | -0.169 | -0.165 | -0.17 | -0.167 |
| 1.401150323501057 | -0.169 | -0.166 | -0.163 | -0.167 | -0.164 |
| 1.404291916154647 | -0.166 | -0.163 | -0.16 | -0.164 | -0.161 |
| 1.407433508808237 | -0.163 | -0.16 | -0.157 | -0.161 | -0.158 |
| 1.410575101461827 | -0.16 | -0.157 | -0.154 | -0.158 | -0.156 |
| 1.413716694115417 | -0.156 | -0.154 | -0.151 | -0.155 | -0.153 |
| 1.416858286769006 | -0.153 | -0.151 | -0.149 | -0.152 | -0.15 |
| 1.419999879422596 | -0.15 | -0.148 | -0.146 | -0.149 | -0.147 |
| 1.423141472076186 | -0.147 | -0.145 | -0.143 | -0.146 | -0.144 |
| 1.426283064729776 | -0.144 | -0.142 | -0.14 | -0.143 | -0.141 |
| 1.429424657383366 | -0.141 | -0.139 | -0.137 | -0.14 | -0.138 |
| 1.432566250036956 | -0.138 | -0.136 | -0.134 | -0.137 | -0.135 |
| 1.435707842690545 | -0.135 | -0.133 | -0.131 | -0.134 | -0.132 |
| 1.438849435344135 | -0.132 | -0.13 | -0.129 | -0.131 | -0.129 |
| 1.441991027997725 | -0.128 | -0.127 | -0.126 | -0.128 | -0.126 |
| 1.445132620651315 | -0.125 | -0.124 | -0.123 | -0.125 | -0.123 |
| 1.448274213304905 | -0.122 | -0.121 | -0.12 | -0.122 | -0.12 |
| 1.451415805958494 | -0.119 | -0.118 | -0.117 | -0.119 | -0.117 |
| 1.454557398612084 | -0.116 | -0.115 | -0.114 | -0.115 | -0.114 |
| 1.457698991265674 | -0.113 | -0.112 | -0.111 | -0.112 | -0.111 |
| 1.460840583919264 | -0.11 | -0.109 | -0.108 | -0.109 | -0.108 |
| 1.463982176572854 | -0.107 | -0.106 | -0.105 | -0.106 | -0.105 |
| 1.467123769226444 | -0.103 | -0.103 | -0.102 | -0.103 | -0.102 |
| 1.470265361880033 | -0.1 | -0.1 | -0.099 | -0.1 | -0.099 |
| 1.473406954533623 | -0.097 | -0.097 | -0.096 | -0.097 | -0.096 |
| 1.476548547187213 | -0.094 | -0.094 | -0.093 | -0.094 | -0.093 |
| 1.479690139840803 | -0.091 | -0.09 | -0.09 | -0.091 | -0.09 |
| 1.482831732494393 | -0.088 | -0.087 | -0.087 | -0.088 | -0.087 |
| 1.485973325147982 | -0.085 | -0.084 | -0.084 | -0.085 | -0.084 |
| 1.489114917801572 | -0.082 | -0.081 | -0.081 | -0.081 | -0.081 |
| 1.492256510455162 | -0.078 | -0.078 | -0.078 | -0.078 | -0.078 |
| 1.495398103108752 | -0.075 | -0.075 | -0.075 | -0.075 | -0.075 |
| 1.498539695762342 | -0.072 | -0.072 | -0.072 | -0.072 | -0.072 |
| 1.501681288415932 | -0.069 | -0.069 | -0.069 | -0.069 | -0.069 |
| 1.504822881069521 | -0.066 | -0.066 | -0.066 | -0.066 | -0.066 |
| 1.507964473723111 | -0.063 | -0.063 | -0.062 | -0.063 | -0.063 |
| 1.511106066376701 | -0.06 | -0.06 | -0.059 | -0.06 | -0.059 |
| 1.514247659030291 | -0.057 | -0.056 | -0.056 | -0.056 | -0.056 |
| 1.517389251683881 | -0.053 | -0.053 | -0.053 | -0.053 | -0.053 |
| 1.520530844337471 | -0.05 | -0.05 | -0.05 | -0.05 | -0.05 |
| 1.52367243699106 | -0.047 | -0.047 | -0.047 | -0.047 | -0.047 |
| 1.52681402964465 | -0.044 | -0.044 | -0.044 | -0.044 | -0.044 |
| 1.52995562229824 | -0.041 | -0.041 | -0.041 | -0.041 | -0.041 |
| 1.53309721495183 | -0.038 | -0.038 | -0.038 | -0.038 | -0.038 |
| 1.53623880760542 | -0.035 | -0.035 | -0.034 | -0.035 | -0.035 |
| 1.539380400259009 | -0.031 | -0.031 | -0.031 | -0.031 | -0.031 |
| 1.542521992912599 | -0.028 | -0.028 | -0.028 | -0.028 | -0.028 |
| 1.545663585566189 | -0.025 | -0.025 | -0.025 | -0.025 | -0.025 |
| 1.548805178219779 | -0.022 | -0.022 | -0.022 | -0.022 | -0.022 |
| 1.551946770873369 | -0.019 | -0.019 | -0.019 | -0.019 | -0.019 |
| 1.555088363526959 | -0.016 | -0.016 | -0.016 | -0.016 | -0.016 |
| 1.558229956180548 | -0.013 | -0.013 | -0.013 | -0.013 | -0.013 |
| 1.561371548834138 | -0.009 | -0.009 | -0.009 | -0.009 | -0.009 |
| 1.564513141487728 | -0.006 | -0.006 | -0.006 | -0.006 | -0.006 |
| 1.567654734141318 | -0.003 | -0.003 | -0.003 | -0.003 | -0.003 |
| 1.570796326794908 | 0 | 0 | 0 | 0 | 0 |
| 1.573937919448497 | 0.003 | 0.003 | 0.003 | 0.003 | 0.003 |
| 1.577079512102087 | 0.006 | 0.006 | 0.006 | 0.006 | 0.006 |
| 1.580221104755677 | 0.009 | 0.009 | 0.009 | 0.009 | 0.009 |
| 1.583362697409267 | 0.013 | 0.013 | 0.013 | 0.013 | 0.013 |
| 1.586504290062857 | 0.016 | 0.016 | 0.016 | 0.016 | 0.016 |
| 1.589645882716447 | 0.019 | 0.019 | 0.019 | 0.019 | 0.019 |
| 1.592787475370036 | 0.022 | 0.022 | 0.022 | 0.022 | 0.022 |
| 1.595929068023626 | 0.025 | 0.025 | 0.025 | 0.025 | 0.025 |
| 1.599070660677216 | 0.028 | 0.028 | 0.028 | 0.028 | 0.028 |
| 1.602212253330806 | 0.031 | 0.031 | 0.031 | 0.031 | 0.031 |
| 1.605353845984396 | 0.035 | 0.035 | 0.034 | 0.035 | 0.035 |
| 1.608495438637985 | 0.038 | 0.038 | 0.038 | 0.038 | 0.038 |
| 1.611637031291575 | 0.041 | 0.041 | 0.041 | 0.041 | 0.041 |
| 1.614778623945165 | 0.044 | 0.044 | 0.044 | 0.044 | 0.044 |
| 1.617920216598755 | 0.047 | 0.047 | 0.047 | 0.047 | 0.047 |
| 1.621061809252345 | 0.05 | 0.05 | 0.05 | 0.05 | 0.05 |
| 1.624203401905935 | 0.053 | 0.053 | 0.053 | 0.053 | 0.053 |
| 1.627344994559524 | 0.057 | 0.056 | 0.056 | 0.056 | 0.056 |
| 1.630486587213114 | 0.06 | 0.06 | 0.059 | 0.06 | 0.059 |
| 1.633628179866704 | 0.063 | 0.063 | 0.062 | 0.063 | 0.063 |
| 1.636769772520294 | 0.066 | 0.066 | 0.066 | 0.066 | 0.066 |
| 1.639911365173884 | 0.069 | 0.069 | 0.069 | 0.069 | 0.069 |
| 1.643052957827473 | 0.072 | 0.072 | 0.072 | 0.072 | 0.072 |
| 1.646194550481063 | 0.075 | 0.075 | 0.075 | 0.075 | 0.075 |
| 1.649336143134653 | 0.078 | 0.078 | 0.078 | 0.078 | 0.078 |
| 1.652477735788243 | 0.082 | 0.081 | 0.081 | 0.081 | 0.081 |
| 1.655619328441833 | 0.085 | 0.084 | 0.084 | 0.085 | 0.084 |
| 1.658760921095423 | 0.088 | 0.087 | 0.087 | 0.088 | 0.087 |
| 1.661902513749012 | 0.091 | 0.09 | 0.09 | 0.091 | 0.09 |
| 1.665044106402602 | 0.094 | 0.094 | 0.093 | 0.094 | 0.093 |
| 1.668185699056192 | 0.097 | 0.097 | 0.096 | 0.097 | 0.096 |
| 1.671327291709782 | 0.1 | 0.1 | 0.099 | 0.1 | 0.099 |
| 1.674468884363372 | 0.103 | 0.103 | 0.102 | 0.103 | 0.102 |
| 1.677610477016961 | 0.107 | 0.106 | 0.105 | 0.106 | 0.105 |
| 1.680752069670551 | 0.11 | 0.109 | 0.108 | 0.109 | 0.108 |
| 1.683893662324141 | 0.113 | 0.112 | 0.111 | 0.112 | 0.111 |
| 1.687035254977731 | 0.116 | 0.115 | 0.114 | 0.115 | 0.114 |
| 1.690176847631321 | 0.119 | 0.118 | 0.117 | 0.119 | 0.117 |
| 1.693318440284911 | 0.122 | 0.121 | 0.12 | 0.122 | 0.12 |
| 1.6964600329385 | 0.125 | 0.124 | 0.123 | 0.125 | 0.123 |
| 1.69960162559209 | 0.128 | 0.127 | 0.126 | 0.128 | 0.126 |
| 1.70274321824568 | 0.132 | 0.13 | 0.129 | 0.131 | 0.129 |
| 1.70588481089927 | 0.135 | 0.133 | 0.131 | 0.134 | 0.132 |
| 1.70902640355286 | 0.138 | 0.136 | 0.134 | 0.137 | 0.135 |
| 1.712167996206449 | 0.141 | 0.139 | 0.137 | 0.14 | 0.138 |
| 1.715309588860039 | 0.144 | 0.142 | 0.14 | 0.143 | 0.141 |
| 1.71845118151363 | 0.147 | 0.145 | 0.143 | 0.146 | 0.144 |
| 1.721592774167219 | 0.15 | 0.148 | 0.146 | 0.149 | 0.147 |
| 1.724734366820809 | 0.153 | 0.151 | 0.149 | 0.152 | 0.15 |
| 1.727875959474399 | 0.156 | 0.154 | 0.151 | 0.155 | 0.153 |
| 1.731017552127988 | 0.16 | 0.157 | 0.154 | 0.158 | 0.156 |
| 1.734159144781578 | 0.163 | 0.16 | 0.157 | 0.161 | 0.158 |
| 1.737300737435168 | 0.166 | 0.163 | 0.16 | 0.164 | 0.161 |
| 1.740442330088758 | 0.169 | 0.166 | 0.163 | 0.167 | 0.164 |
| 1.743583922742348 | 0.172 | 0.169 | 0.165 | 0.17 | 0.167 |
| 1.746725515395937 | 0.175 | 0.171 | 0.168 | 0.173 | 0.17 |
| 1.749867108049527 | 0.178 | 0.174 | 0.171 | 0.176 | 0.173 |
| 1.753008700703117 | 0.181 | 0.177 | 0.174 | 0.179 | 0.175 |
| 1.756150293356707 | 0.184 | 0.18 | 0.176 | 0.182 | 0.178 |
| 1.759291886010297 | 0.187 | 0.183 | 0.179 | 0.185 | 0.181 |
| 1.762433478663887 | 0.19 | 0.186 | 0.182 | 0.188 | 0.184 |
| 1.765575071317476 | 0.194 | 0.189 | 0.184 | 0.191 | 0.186 |
| 1.768716663971066 | 0.197 | 0.192 | 0.187 | 0.194 | 0.189 |
| 1.771858256624656 | 0.2 | 0.194 | 0.189 | 0.197 | 0.192 |
| 1.774999849278246 | 0.203 | 0.197 | 0.192 | 0.2 | 0.195 |
| 1.778141441931836 | 0.206 | 0.2 | 0.195 | 0.203 | 0.197 |
| 1.781283034585426 | 0.209 | 0.203 | 0.197 | 0.206 | 0.2 |
| 1.784424627239015 | 0.212 | 0.206 | 0.2 | 0.209 | 0.203 |
| 1.787566219892605 | 0.215 | 0.209 | 0.202 | 0.212 | 0.205 |
| 1.790707812546195 | 0.218 | 0.211 | 0.205 | 0.215 | 0.208 |
| 1.793849405199785 | 0.221 | 0.214 | 0.207 | 0.218 | 0.211 |
| 1.796990997853375 | 0.224 | 0.217 | 0.21 | 0.221 | 0.213 |
| 1.800132590506964 | 0.227 | 0.22 | 0.212 | 0.223 | 0.216 |
| 1.803274183160554 | 0.23 | 0.222 | 0.215 | 0.226 | 0.219 |
| 1.806415775814144 | 0.233 | 0.225 | 0.217 | 0.229 | 0.221 |
| 1.809557368467734 | 0.236 | 0.228 | 0.22 | 0.232 | 0.224 |
| 1.812698961121324 | 0.24 | 0.231 | 0.222 | 0.235 | 0.226 |
| 1.815840553774914 | 0.243 | 0.233 | 0.225 | 0.238 | 0.229 |
| 1.818982146428503 | 0.246 | 0.236 | 0.227 | 0.241 | 0.231 |
| 1.822123739082093 | 0.249 | 0.239 | 0.229 | 0.244 | 0.234 |
| 1.825265331735683 | 0.252 | 0.241 | 0.232 | 0.246 | 0.236 |
| 1.828406924389273 | 0.255 | 0.244 | 0.234 | 0.249 | 0.239 |
| 1.831548517042863 | 0.258 | 0.247 | 0.236 | 0.252 | 0.241 |
| 1.834690109696452 | 0.261 | 0.249 | 0.239 | 0.255 | 0.244 |
| 1.837831702350042 | 0.264 | 0.252 | 0.241 | 0.258 | 0.246 |
| 1.840973295003632 | 0.267 | 0.254 | 0.243 | 0.261 | 0.249 |
| 1.844114887657222 | 0.27 | 0.257 | 0.245 | 0.263 | 0.251 |
| 1.847256480310812 | 0.273 | 0.26 | 0.248 | 0.266 | 0.254 |
| 1.850398072964402 | 0.276 | 0.262 | 0.25 | 0.269 | 0.256 |
| 1.853539665617991 | 0.279 | 0.265 | 0.252 | 0.272 | 0.258 |
| 1.856681258271581 | 0.282 | 0.267 | 0.254 | 0.275 | 0.261 |
| 1.859822850925171 | 0.285 | 0.27 | 0.256 | 0.277 | 0.263 |
| 1.862964443578761 | 0.288 | 0.272 | 0.258 | 0.28 | 0.265 |
| 1.866106036232351 | 0.291 | 0.275 | 0.261 | 0.283 | 0.268 |
| 1.86924762888594 | 0.294 | 0.278 | 0.263 | 0.286 | 0.27 |
| 1.87238922153953 | 0.297 | 0.28 | 0.265 | 0.288 | 0.272 |
| 1.87553081419312 | 0.3 | 0.283 | 0.267 | 0.291 | 0.274 |
| 1.87867240684671 | 0.303 | 0.285 | 0.269 | 0.294 | 0.277 |
| 1.8818139995003 | 0.306 | 0.287 | 0.271 | 0.296 | 0.279 |
| 1.88495559215389 | 0.309 | 0.29 | 0.273 | 0.299 | 0.281 |
| 1.888097184807479 | 0.312 | 0.292 | 0.275 | 0.302 | 0.283 |
| 1.891238777461069 | 0.315 | 0.295 | 0.277 | 0.305 | 0.286 |
| 1.89438037011466 | 0.318 | 0.297 | 0.279 | 0.307 | 0.288 |
| 1.897521962768249 | 0.321 | 0.3 | 0.281 | 0.31 | 0.29 |
| 1.900663555421839 | 0.324 | 0.302 | 0.283 | 0.313 | 0.292 |
| 1.903805148075429 | 0.327 | 0.304 | 0.285 | 0.315 | 0.294 |
| 1.906946740729018 | 0.33 | 0.307 | 0.286 | 0.318 | 0.296 |
| 1.910088333382608 | 0.333 | 0.309 | 0.288 | 0.321 | 0.298 |
| 1.913229926036198 | 0.336 | 0.311 | 0.29 | 0.323 | 0.3 |
| 1.916371518689788 | 0.339 | 0.314 | 0.292 | 0.326 | 0.302 |
| 1.919513111343378 | 0.342 | 0.316 | 0.294 | 0.328 | 0.305 |
| 1.922654703996967 | 0.345 | 0.318 | 0.296 | 0.331 | 0.307 |
| 1.925796296650557 | 0.348 | 0.321 | 0.297 | 0.334 | 0.309 |
| 1.928937889304147 | 0.351 | 0.323 | 0.299 | 0.336 | 0.311 |
| 1.932079481957737 | 0.353 | 0.325 | 0.301 | 0.339 | 0.313 |
| 1.935221074611327 | 0.356 | 0.327 | 0.303 | 0.341 | 0.314 |
| 1.938362667264917 | 0.359 | 0.33 | 0.304 | 0.344 | 0.316 |
| 1.941504259918506 | 0.362 | 0.332 | 0.306 | 0.346 | 0.318 |
| 1.944645852572096 | 0.365 | 0.334 | 0.308 | 0.349 | 0.32 |
| 1.947787445225686 | 0.368 | 0.336 | 0.309 | 0.351 | 0.322 |
| 1.950929037879276 | 0.371 | 0.338 | 0.311 | 0.354 | 0.324 |
| 1.954070630532866 | 0.374 | 0.341 | 0.312 | 0.357 | 0.326 |
| 1.957212223186455 | 0.377 | 0.343 | 0.314 | 0.359 | 0.328 |
| 1.960353815840045 | 0.38 | 0.345 | 0.316 | 0.362 | 0.33 |
| 1.963495408493635 | 0.383 | 0.347 | 0.317 | 0.364 | 0.331 |
| 1.966637001147225 | 0.386 | 0.349 | 0.319 | 0.366 | 0.333 |
| 1.969778593800815 | 0.388 | 0.351 | 0.32 | 0.369 | 0.335 |
| 1.972920186454405 | 0.391 | 0.353 | 0.322 | 0.371 | 0.337 |
| 1.976061779107994 | 0.394 | 0.355 | 0.323 | 0.374 | 0.338 |
| 1.979203371761584 | 0.397 | 0.357 | 0.325 | 0.376 | 0.34 |
| 1.982344964415174 | 0.4 | 0.359 | 0.326 | 0.379 | 0.342 |
| 1.985486557068764 | 0.403 | 0.361 | 0.327 | 0.381 | 0.344 |
| 1.988628149722354 | 0.406 | 0.363 | 0.329 | 0.384 | 0.345 |
| 1.991769742375943 | 0.409 | 0.365 | 0.33 | 0.386 | 0.347 |
| 1.994911335029533 | 0.412 | 0.367 | 0.332 | 0.388 | 0.349 |
| 1.998052927683123 | 0.414 | 0.369 | 0.333 | 0.391 | 0.35 |
| 2.001194520336712 | 0.417 | 0.371 | 0.334 | 0.393 | 0.352 |
| 2.004336112990302 | 0.42 | 0.373 | 0.336 | 0.395 | 0.353 |
| 2.007477705643892 | 0.423 | 0.375 | 0.337 | 0.398 | 0.355 |
| 2.010619298297482 | 0.426 | 0.377 | 0.338 | 0.4 | 0.357 |
| 2.013760890951071 | 0.429 | 0.379 | 0.34 | 0.402 | 0.358 |
| 2.016902483604661 | 0.431 | 0.381 | 0.341 | 0.405 | 0.36 |
| 2.02004407625825 | 0.434 | 0.383 | 0.342 | 0.407 | 0.361 |
| 2.02318566891184 | 0.437 | 0.385 | 0.343 | 0.409 | 0.363 |
| 2.02632726156543 | 0.44 | 0.386 | 0.344 | 0.412 | 0.364 |
| 2.029468854219019 | 0.443 | 0.388 | 0.346 | 0.414 | 0.366 |
| 2.032610446872609 | 0.446 | 0.39 | 0.347 | 0.416 | 0.367 |
| 2.035752039526198 | 0.448 | 0.392 | 0.348 | 0.418 | 0.369 |
| 2.038893632179788 | 0.451 | 0.394 | 0.349 | 0.421 | 0.37 |
| 2.042035224833378 | 0.454 | 0.395 | 0.35 | 0.423 | 0.371 |
| 2.045176817486967 | 0.457 | 0.397 | 0.351 | 0.425 | 0.373 |
| 2.048318410140557 | 0.46 | 0.399 | 0.352 | 0.427 | 0.374 |
| 2.051460002794146 | 0.462 | 0.401 | 0.353 | 0.429 | 0.376 |
| 2.054601595447736 | 0.465 | 0.402 | 0.355 | 0.432 | 0.377 |
| 2.057743188101325 | 0.468 | 0.404 | 0.356 | 0.434 | 0.378 |
| 2.060884780754915 | 0.471 | 0.406 | 0.357 | 0.436 | 0.38 |
| 2.064026373408505 | 0.473 | 0.407 | 0.358 | 0.438 | 0.381 |
| 2.067167966062094 | 0.476 | 0.409 | 0.359 | 0.44 | 0.382 |
| 2.070309558715684 | 0.479 | 0.411 | 0.36 | 0.442 | 0.383 |
| 2.073451151369273 | 0.482 | 0.412 | 0.361 | 0.444 | 0.385 |
| 2.076592744022863 | 0.485 | 0.414 | 0.361 | 0.447 | 0.386 |
| 2.079734336676452 | 0.487 | 0.416 | 0.362 | 0.449 | 0.387 |
| 2.082875929330042 | 0.49 | 0.417 | 0.363 | 0.451 | 0.388 |
| 2.086017521983632 | 0.493 | 0.419 | 0.364 | 0.453 | 0.39 |
| 2.089159114637221 | 0.495 | 0.42 | 0.365 | 0.455 | 0.391 |
| 2.092300707290811 | 0.498 | 0.422 | 0.366 | 0.457 | 0.392 |
| 2.095442299944401 | 0.501 | 0.423 | 0.367 | 0.459 | 0.393 |
| 2.09858389259799 | 0.504 | 0.425 | 0.368 | 0.461 | 0.394 |
| 2.10172548525158 | 0.506 | 0.426 | 0.369 | 0.463 | 0.395 |
| 2.104867077905169 | 0.509 | 0.428 | 0.369 | 0.465 | 0.396 |
| 2.108008670558759 | 0.512 | 0.429 | 0.37 | 0.467 | 0.397 |
| 2.111150263212349 | 0.514 | 0.431 | 0.371 | 0.469 | 0.399 |
| 2.114291855865938 | 0.517 | 0.432 | 0.372 | 0.471 | 0.4 |
| 2.117433448519528 | 0.52 | 0.434 | 0.373 | 0.473 | 0.401 |
| 2.120575041173117 | 0.522 | 0.435 | 0.373 | 0.475 | 0.402 |
| 2.123716633826707 | 0.525 | 0.437 | 0.374 | 0.477 | 0.403 |
| 2.126858226480297 | 0.528 | 0.438 | 0.375 | 0.479 | 0.404 |
| 2.129999819133886 | 0.531 | 0.439 | 0.375 | 0.481 | 0.405 |
| 2.133141411787476 | 0.533 | 0.441 | 0.376 | 0.483 | 0.406 |
| 2.136283004441065 | 0.536 | 0.442 | 0.377 | 0.485 | 0.407 |
| 2.139424597094655 | 0.538 | 0.443 | 0.378 | 0.486 | 0.408 |
| 2.142566189748245 | 0.541 | 0.445 | 0.378 | 0.488 | 0.409 |
| 2.145707782401834 | 0.544 | 0.446 | 0.379 | 0.49 | 0.409 |
| 2.148849375055424 | 0.546 | 0.447 | 0.38 | 0.492 | 0.41 |
| 2.151990967709013 | 0.549 | 0.449 | 0.38 | 0.494 | 0.411 |
| 2.155132560362603 | 0.552 | 0.45 | 0.381 | 0.496 | 0.412 |
| 2.158274153016193 | 0.554 | 0.451 | 0.381 | 0.498 | 0.413 |
| 2.161415745669782 | 0.557 | 0.452 | 0.382 | 0.499 | 0.414 |
| 2.164557338323372 | 0.559 | 0.454 | 0.383 | 0.501 | 0.415 |
| 2.167698930976961 | 0.562 | 0.455 | 0.383 | 0.503 | 0.416 |
| 2.170840523630551 | 0.565 | 0.456 | 0.384 | 0.505 | 0.416 |
| 2.173982116284141 | 0.567 | 0.457 | 0.384 | 0.506 | 0.417 |
| 2.17712370893773 | 0.57 | 0.459 | 0.385 | 0.508 | 0.418 |
| 2.18026530159132 | 0.572 | 0.46 | 0.385 | 0.51 | 0.419 |
| 2.183406894244909 | 0.575 | 0.461 | 0.386 | 0.512 | 0.42 |
| 2.186548486898499 | 0.578 | 0.462 | 0.386 | 0.513 | 0.42 |
| 2.189690079552089 | 0.58 | 0.463 | 0.387 | 0.515 | 0.421 |
| 2.192831672205678 | 0.583 | 0.464 | 0.387 | 0.517 | 0.422 |
| 2.195973264859268 | 0.585 | 0.465 | 0.388 | 0.518 | 0.423 |
| 2.199114857512857 | 0.588 | 0.466 | 0.388 | 0.52 | 0.423 |
| 2.202256450166447 | 0.59 | 0.468 | 0.389 | 0.522 | 0.424 |
| 2.205398042820036 | 0.593 | 0.469 | 0.389 | 0.523 | 0.425 |
| 2.208539635473626 | 0.595 | 0.47 | 0.39 | 0.525 | 0.425 |
| 2.211681228127216 | 0.598 | 0.471 | 0.39 | 0.527 | 0.426 |
| 2.214822820780805 | 0.6 | 0.472 | 0.391 | 0.528 | 0.427 |
| 2.217964413434395 | 0.603 | 0.473 | 0.391 | 0.53 | 0.427 |
| 2.221106006087984 | 0.605 | 0.474 | 0.391 | 0.531 | 0.428 |
| 2.224247598741574 | 0.608 | 0.475 | 0.392 | 0.533 | 0.429 |
| 2.227389191395164 | 0.61 | 0.476 | 0.392 | 0.535 | 0.429 |
| 2.230530784048753 | 0.613 | 0.477 | 0.392 | 0.536 | 0.43 |
| 2.233672376702343 | 0.615 | 0.478 | 0.393 | 0.538 | 0.431 |
| 2.236813969355933 | 0.618 | 0.479 | 0.393 | 0.539 | 0.431 |
| 2.239955562009522 | 0.62 | 0.48 | 0.394 | 0.541 | 0.432 |
| 2.243097154663112 | 0.623 | 0.48 | 0.394 | 0.542 | 0.432 |
| 2.246238747316701 | 0.625 | 0.481 | 0.394 | 0.544 | 0.433 |
| 2.249380339970291 | 0.628 | 0.482 | 0.395 | 0.545 | 0.433 |
| 2.252521932623881 | 0.63 | 0.483 | 0.395 | 0.547 | 0.434 |
| 2.25566352527747 | 0.633 | 0.484 | 0.395 | 0.548 | 0.434 |
| 2.25880511793106 | 0.635 | 0.485 | 0.396 | 0.55 | 0.435 |
| 2.261946710584649 | 0.637 | 0.486 | 0.396 | 0.551 | 0.435 |
| 2.265088303238239 | 0.64 | 0.487 | 0.396 | 0.553 | 0.436 |
| 2.268229895891829 | 0.642 | 0.487 | 0.396 | 0.554 | 0.436 |
| 2.271371488545418 | 0.645 | 0.488 | 0.397 | 0.555 | 0.437 |
| 2.274513081199008 | 0.647 | 0.489 | 0.397 | 0.557 | 0.437 |
| 2.277654673852597 | 0.649 | 0.49 | 0.397 | 0.558 | 0.438 |
| 2.280796266506186 | 0.652 | 0.491 | 0.398 | 0.56 | 0.438 |
| 2.283937859159776 | 0.654 | 0.492 | 0.398 | 0.561 | 0.439 |
| 2.287079451813366 | 0.657 | 0.492 | 0.398 | 0.562 | 0.439 |
| 2.290221044466955 | 0.659 | 0.493 | 0.398 | 0.564 | 0.44 |
| 2.293362637120545 | 0.661 | 0.494 | 0.399 | 0.565 | 0.44 |
| 2.296504229774135 | 0.664 | 0.495 | 0.399 | 0.566 | 0.441 |
| 2.299645822427724 | 0.666 | 0.495 | 0.399 | 0.568 | 0.441 |
| 2.302787415081314 | 0.668 | 0.496 | 0.399 | 0.569 | 0.441 |
| 2.305929007734904 | 0.671 | 0.497 | 0.399 | 0.57 | 0.442 |
| 2.309070600388493 | 0.673 | 0.497 | 0.4 | 0.571 | 0.442 |
| 2.312212193042083 | 0.675 | 0.498 | 0.4 | 0.573 | 0.442 |
| 2.315353785695672 | 0.678 | 0.499 | 0.4 | 0.574 | 0.443 |
| 2.318495378349262 | 0.68 | 0.499 | 0.4 | 0.575 | 0.443 |
| 2.321636971002852 | 0.682 | 0.5 | 0.4 | 0.576 | 0.444 |
| 2.324778563656441 | 0.685 | 0.501 | 0.401 | 0.578 | 0.444 |
| 2.327920156310031 | 0.687 | 0.501 | 0.401 | 0.579 | 0.444 |
| 2.33106174896362 | 0.689 | 0.502 | 0.401 | 0.58 | 0.445 |
| 2.33420334161721 | 0.691 | 0.503 | 0.401 | 0.581 | 0.445 |
| 2.3373449342708 | 0.694 | 0.503 | 0.401 | 0.582 | 0.445 |
| 2.340486526924389 | 0.696 | 0.504 | 0.401 | 0.584 | 0.446 |
| 2.343628119577979 | 0.698 | 0.504 | 0.402 | 0.585 | 0.446 |
| 2.346769712231568 | 0.7 | 0.505 | 0.402 | 0.586 | 0.446 |
| 2.349911304885158 | 0.703 | 0.506 | 0.402 | 0.587 | 0.446 |
| 2.353052897538748 | 0.705 | 0.506 | 0.402 | 0.588 | 0.447 |
| 2.356194490192337 | 0.707 | 0.507 | 0.402 | 0.589 | 0.447 |
| 2.359336082845927 | 0.709 | 0.507 | 0.402 | 0.59 | 0.447 |
| 2.362477675499516 | 0.712 | 0.508 | 0.403 | 0.591 | 0.448 |
| 2.365619268153106 | 0.714 | 0.508 | 0.403 | 0.593 | 0.448 |
| 2.368760860806696 | 0.716 | 0.509 | 0.403 | 0.594 | 0.448 |
| 2.371902453460285 | 0.718 | 0.509 | 0.403 | 0.595 | 0.448 |
| 2.375044046113875 | 0.72 | 0.51 | 0.403 | 0.596 | 0.449 |
| 2.378185638767464 | 0.722 | 0.51 | 0.403 | 0.597 | 0.449 |
| 2.381327231421054 | 0.725 | 0.511 | 0.403 | 0.598 | 0.449 |
| 2.384468824074644 | 0.727 | 0.511 | 0.403 | 0.599 | 0.449 |
| 2.387610416728233 | 0.729 | 0.512 | 0.403 | 0.6 | 0.449 |
| 2.390752009381823 | 0.731 | 0.512 | 0.404 | 0.601 | 0.45 |
| 2.393893602035412 | 0.733 | 0.513 | 0.404 | 0.602 | 0.45 |
| 2.397035194689002 | 0.735 | 0.513 | 0.404 | 0.603 | 0.45 |
| 2.400176787342591 | 0.738 | 0.514 | 0.404 | 0.604 | 0.45 |
| 2.403318379996181 | 0.74 | 0.514 | 0.404 | 0.605 | 0.451 |
| 2.406459972649771 | 0.742 | 0.515 | 0.404 | 0.606 | 0.451 |
| 2.40960156530336 | 0.744 | 0.515 | 0.404 | 0.607 | 0.451 |
| 2.41274315795695 | 0.746 | 0.515 | 0.404 | 0.608 | 0.451 |
| 2.41588475061054 | 0.748 | 0.516 | 0.404 | 0.609 | 0.451 |
| 2.419026343264129 | 0.75 | 0.516 | 0.404 | 0.609 | 0.451 |
| 2.422167935917719 | 0.752 | 0.517 | 0.404 | 0.61 | 0.452 |
| 2.425309528571308 | 0.754 | 0.517 | 0.404 | 0.611 | 0.452 |
| 2.428451121224898 | 0.756 | 0.517 | 0.405 | 0.612 | 0.452 |
| 2.431592713878488 | 0.758 | 0.518 | 0.405 | 0.613 | 0.452 |
| 2.434734306532077 | 0.76 | 0.518 | 0.405 | 0.614 | 0.452 |
| 2.437875899185667 | 0.762 | 0.518 | 0.405 | 0.615 | 0.452 |
| 2.441017491839256 | 0.764 | 0.519 | 0.405 | 0.616 | 0.453 |
| 2.444159084492846 | 0.766 | 0.519 | 0.405 | 0.616 | 0.453 |
| 2.447300677146435 | 0.769 | 0.52 | 0.405 | 0.617 | 0.453 |
| 2.450442269800025 | 0.771 | 0.52 | 0.405 | 0.618 | 0.453 |
| 2.453583862453615 | 0.773 | 0.52 | 0.405 | 0.619 | 0.453 |
| 2.456725455107204 | 0.775 | 0.521 | 0.405 | 0.62 | 0.453 |
| 2.459867047760794 | 0.776 | 0.521 | 0.405 | 0.62 | 0.453 |
| 2.463008640414384 | 0.778 | 0.521 | 0.405 | 0.621 | 0.453 |
| 2.466150233067973 | 0.78 | 0.521 | 0.405 | 0.622 | 0.454 |
| 2.469291825721563 | 0.782 | 0.522 | 0.405 | 0.623 | 0.454 |
| 2.472433418375152 | 0.784 | 0.522 | 0.405 | 0.624 | 0.454 |
| 2.475575011028742 | 0.786 | 0.522 | 0.405 | 0.624 | 0.454 |
| 2.478716603682332 | 0.788 | 0.523 | 0.405 | 0.625 | 0.454 |
| 2.481858196335921 | 0.79 | 0.523 | 0.405 | 0.626 | 0.454 |
| 2.48499978898951 | 0.792 | 0.523 | 0.405 | 0.626 | 0.454 |
| 2.4881413816431 | 0.794 | 0.523 | 0.406 | 0.627 | 0.454 |
| 2.49128297429669 | 0.796 | 0.524 | 0.406 | 0.628 | 0.454 |
| 2.49442456695028 | 0.798 | 0.524 | 0.406 | 0.629 | 0.455 |
| 2.497566159603869 | 0.8 | 0.524 | 0.406 | 0.629 | 0.455 |
| 2.500707752257458 | 0.802 | 0.524 | 0.406 | 0.63 | 0.455 |
| 2.503849344911048 | 0.803 | 0.525 | 0.406 | 0.631 | 0.455 |
| 2.506990937564638 | 0.805 | 0.525 | 0.406 | 0.631 | 0.455 |
| 2.510132530218228 | 0.807 | 0.525 | 0.406 | 0.632 | 0.455 |
| 2.513274122871817 | 0.809 | 0.525 | 0.406 | 0.633 | 0.455 |
| 2.516415715525407 | 0.811 | 0.526 | 0.406 | 0.633 | 0.455 |
| 2.519557308178996 | 0.813 | 0.526 | 0.406 | 0.634 | 0.455 |
| 2.522698900832586 | 0.815 | 0.526 | 0.406 | 0.634 | 0.455 |
| 2.525840493486176 | 0.816 | 0.526 | 0.406 | 0.635 | 0.455 |
| 2.528982086139765 | 0.818 | 0.526 | 0.406 | 0.636 | 0.455 |
| 2.532123678793355 | 0.82 | 0.527 | 0.406 | 0.636 | 0.455 |
| 2.535265271446944 | 0.822 | 0.527 | 0.406 | 0.637 | 0.456 |
| 2.538406864100534 | 0.824 | 0.527 | 0.406 | 0.637 | 0.456 |
| 2.541548456754124 | 0.825 | 0.527 | 0.406 | 0.638 | 0.456 |
| 2.544690049407713 | 0.827 | 0.527 | 0.406 | 0.638 | 0.456 |
| 2.547831642061302 | 0.829 | 0.527 | 0.406 | 0.639 | 0.456 |
| 2.550973234714892 | 0.831 | 0.528 | 0.406 | 0.64 | 0.456 |
| 2.554114827368482 | 0.832 | 0.528 | 0.406 | 0.64 | 0.456 |
| 2.557256420022072 | 0.834 | 0.528 | 0.406 | 0.641 | 0.456 |
| 2.560398012675661 | 0.836 | 0.528 | 0.406 | 0.641 | 0.456 |
| 2.563539605329251 | 0.838 | 0.528 | 0.406 | 0.642 | 0.456 |
| 2.56668119798284 | 0.839 | 0.528 | 0.406 | 0.642 | 0.456 |
| 2.56982279063643 | 0.841 | 0.529 | 0.406 | 0.643 | 0.456 |
| 2.57296438329002 | 0.843 | 0.529 | 0.406 | 0.643 | 0.456 |
| 2.576105975943609 | 0.844 | 0.529 | 0.406 | 0.644 | 0.456 |
| 2.579247568597199 | 0.846 | 0.529 | 0.406 | 0.644 | 0.456 |
| 2.582389161250788 | 0.848 | 0.529 | 0.406 | 0.645 | 0.456 |
| 2.585530753904377 | 0.849 | 0.529 | 0.406 | 0.645 | 0.456 |
| 2.588672346557967 | 0.851 | 0.529 | 0.406 | 0.646 | 0.456 |
| 2.591813939211557 | 0.853 | 0.53 | 0.406 | 0.646 | 0.456 |
| 2.594955531865147 | 0.854 | 0.53 | 0.406 | 0.646 | 0.456 |
| 2.598097124518736 | 0.856 | 0.53 | 0.406 | 0.647 | 0.456 |
| 2.601238717172326 | 0.858 | 0.53 | 0.406 | 0.647 | 0.456 |
| 2.604380309825915 | 0.859 | 0.53 | 0.406 | 0.648 | 0.456 |
| 2.607521902479505 | 0.861 | 0.53 | 0.406 | 0.648 | 0.457 |
| 2.610663495133095 | 0.862 | 0.53 | 0.406 | 0.649 | 0.457 |
| 2.613805087786684 | 0.864 | 0.53 | 0.406 | 0.649 | 0.457 |
| 2.616946680440274 | 0.866 | 0.53 | 0.406 | 0.649 | 0.457 |
| 2.620088273093863 | 0.867 | 0.531 | 0.406 | 0.65 | 0.457 |
| 2.623229865747452 | 0.869 | 0.531 | 0.406 | 0.65 | 0.457 |
| 2.626371458401042 | 0.87 | 0.531 | 0.406 | 0.651 | 0.457 |
| 2.629513051054632 | 0.872 | 0.531 | 0.406 | 0.651 | 0.457 |
| 2.632654643708222 | 0.873 | 0.531 | 0.406 | 0.651 | 0.457 |
| 2.635796236361811 | 0.875 | 0.531 | 0.406 | 0.652 | 0.457 |
| 2.638937829015401 | 0.876 | 0.531 | 0.406 | 0.652 | 0.457 |
| 2.642079421668991 | 0.878 | 0.531 | 0.406 | 0.652 | 0.457 |
| 2.64522101432258 | 0.879 | 0.531 | 0.406 | 0.653 | 0.457 |
| 2.64836260697617 | 0.881 | 0.531 | 0.406 | 0.653 | 0.457 |
| 2.651504199629759 | 0.882 | 0.531 | 0.406 | 0.653 | 0.457 |
| 2.654645792283349 | 0.884 | 0.531 | 0.406 | 0.654 | 0.457 |
| 2.657787384936938 | 0.885 | 0.531 | 0.406 | 0.654 | 0.457 |
| 2.660928977590528 | 0.887 | 0.532 | 0.406 | 0.654 | 0.457 |
| 2.664070570244118 | 0.888 | 0.532 | 0.406 | 0.655 | 0.457 |
| 2.667212162897707 | 0.89 | 0.532 | 0.406 | 0.655 | 0.457 |
| 2.670353755551297 | 0.891 | 0.532 | 0.406 | 0.655 | 0.457 |
| 2.673495348204887 | 0.892 | 0.532 | 0.406 | 0.656 | 0.457 |
| 2.676636940858476 | 0.894 | 0.532 | 0.406 | 0.656 | 0.457 |
| 2.679778533512066 | 0.895 | 0.532 | 0.406 | 0.656 | 0.457 |
| 2.682920126165655 | 0.897 | 0.532 | 0.406 | 0.656 | 0.457 |
| 2.686061718819245 | 0.898 | 0.532 | 0.406 | 0.657 | 0.457 |
| 2.689203311472835 | 0.899 | 0.532 | 0.406 | 0.657 | 0.457 |
| 2.692344904126424 | 0.901 | 0.532 | 0.406 | 0.657 | 0.457 |
| 2.695486496780014 | 0.902 | 0.532 | 0.406 | 0.657 | 0.457 |
| 2.698628089433603 | 0.903 | 0.532 | 0.406 | 0.658 | 0.457 |
| 2.701769682087193 | 0.905 | 0.532 | 0.406 | 0.658 | 0.457 |
| 2.704911274740782 | 0.906 | 0.532 | 0.406 | 0.658 | 0.457 |
| 2.708052867394372 | 0.907 | 0.532 | 0.406 | 0.658 | 0.457 |
| 2.711194460047962 | 0.909 | 0.532 | 0.406 | 0.659 | 0.457 |
| 2.714336052701551 | 0.91 | 0.532 | 0.406 | 0.659 | 0.457 |
| 2.717477645355141 | 0.911 | 0.532 | 0.406 | 0.659 | 0.457 |
| 2.720619238008731 | 0.913 | 0.533 | 0.406 | 0.659 | 0.457 |
| 2.72376083066232 | 0.914 | 0.533 | 0.406 | 0.659 | 0.457 |
| 2.72690242331591 | 0.915 | 0.533 | 0.406 | 0.66 | 0.457 |
| 2.730044015969499 | 0.917 | 0.533 | 0.406 | 0.66 | 0.457 |
| 2.733185608623089 | 0.918 | 0.533 | 0.406 | 0.66 | 0.457 |
| 2.736327201276678 | 0.919 | 0.533 | 0.406 | 0.66 | 0.457 |
| 2.739468793930268 | 0.92 | 0.533 | 0.406 | 0.66 | 0.457 |
| 2.742610386583858 | 0.921 | 0.533 | 0.406 | 0.661 | 0.457 |
| 2.745751979237447 | 0.923 | 0.533 | 0.406 | 0.661 | 0.457 |
| 2.748893571891036 | 0.924 | 0.533 | 0.406 | 0.661 | 0.457 |
| 2.752035164544627 | 0.925 | 0.533 | 0.406 | 0.661 | 0.457 |
| 2.755176757198216 | 0.926 | 0.533 | 0.406 | 0.661 | 0.457 |
| 2.758318349851806 | 0.927 | 0.533 | 0.406 | 0.662 | 0.457 |
| 2.761459942505395 | 0.929 | 0.533 | 0.406 | 0.662 | 0.457 |
| 2.764601535158985 | 0.93 | 0.533 | 0.406 | 0.662 | 0.457 |
| 2.767743127812574 | 0.931 | 0.533 | 0.406 | 0.662 | 0.457 |
| 2.770884720466164 | 0.932 | 0.533 | 0.406 | 0.662 | 0.457 |
| 2.774026313119754 | 0.933 | 0.533 | 0.406 | 0.662 | 0.457 |
| 2.777167905773343 | 0.934 | 0.533 | 0.406 | 0.662 | 0.457 |
| 2.780309498426932 | 0.935 | 0.533 | 0.406 | 0.663 | 0.457 |
| 2.783451091080522 | 0.937 | 0.533 | 0.406 | 0.663 | 0.457 |
| 2.786592683734112 | 0.938 | 0.533 | 0.406 | 0.663 | 0.457 |
| 2.789734276387701 | 0.939 | 0.533 | 0.406 | 0.663 | 0.457 |
| 2.792875869041291 | 0.94 | 0.533 | 0.406 | 0.663 | 0.457 |
| 2.796017461694881 | 0.941 | 0.533 | 0.406 | 0.663 | 0.457 |
| 2.79915905434847 | 0.942 | 0.533 | 0.406 | 0.663 | 0.457 |
| 2.80230064700206 | 0.943 | 0.533 | 0.406 | 0.663 | 0.457 |
| 2.80544223965565 | 0.944 | 0.533 | 0.406 | 0.664 | 0.457 |
| 2.808583832309239 | 0.945 | 0.533 | 0.406 | 0.664 | 0.457 |
| 2.811725424962829 | 0.946 | 0.533 | 0.406 | 0.664 | 0.457 |
| 2.814867017616419 | 0.947 | 0.533 | 0.406 | 0.664 | 0.457 |
| 2.818008610270008 | 0.948 | 0.533 | 0.406 | 0.664 | 0.457 |
| 2.821150202923598 | 0.949 | 0.533 | 0.406 | 0.664 | 0.457 |
| 2.824291795577187 | 0.95 | 0.533 | 0.406 | 0.664 | 0.457 |
| 2.827433388230777 | 0.951 | 0.533 | 0.406 | 0.664 | 0.457 |
| 2.830574980884366 | 0.952 | 0.533 | 0.406 | 0.664 | 0.457 |
| 2.833716573537956 | 0.953 | 0.533 | 0.406 | 0.664 | 0.457 |
| 2.836858166191546 | 0.954 | 0.533 | 0.406 | 0.665 | 0.457 |
| 2.839999758845135 | 0.955 | 0.533 | 0.406 | 0.665 | 0.457 |
| 2.843141351498725 | 0.956 | 0.533 | 0.406 | 0.665 | 0.457 |
| 2.846282944152314 | 0.957 | 0.533 | 0.406 | 0.665 | 0.457 |
| 2.849424536805904 | 0.958 | 0.533 | 0.406 | 0.665 | 0.457 |
| 2.852566129459494 | 0.959 | 0.533 | 0.406 | 0.665 | 0.457 |
| 2.855707722113083 | 0.959 | 0.533 | 0.406 | 0.665 | 0.457 |
| 2.858849314766673 | 0.96 | 0.533 | 0.406 | 0.665 | 0.457 |
| 2.861990907420262 | 0.961 | 0.533 | 0.406 | 0.665 | 0.457 |
| 2.865132500073852 | 0.962 | 0.533 | 0.406 | 0.665 | 0.457 |
| 2.868274092727442 | 0.963 | 0.533 | 0.406 | 0.665 | 0.457 |
| 2.871415685381031 | 0.964 | 0.533 | 0.406 | 0.665 | 0.457 |
| 2.874557278034621 | 0.965 | 0.533 | 0.406 | 0.665 | 0.457 |
| 2.87769887068821 | 0.965 | 0.533 | 0.406 | 0.665 | 0.457 |
| 2.8808404633418 | 0.966 | 0.533 | 0.406 | 0.666 | 0.457 |
| 2.88398205599539 | 0.967 | 0.533 | 0.406 | 0.666 | 0.457 |
| 2.88712364864898 | 0.968 | 0.533 | 0.406 | 0.666 | 0.457 |
| 2.890265241302569 | 0.969 | 0.533 | 0.406 | 0.666 | 0.457 |
| 2.893406833956158 | 0.969 | 0.533 | 0.406 | 0.666 | 0.457 |
| 2.896548426609748 | 0.97 | 0.533 | 0.406 | 0.666 | 0.457 |
| 2.899690019263338 | 0.971 | 0.533 | 0.406 | 0.666 | 0.457 |
| 2.902831611916927 | 0.972 | 0.533 | 0.406 | 0.666 | 0.457 |
| 2.905973204570517 | 0.972 | 0.533 | 0.406 | 0.666 | 0.457 |
| 2.909114797224106 | 0.973 | 0.533 | 0.406 | 0.666 | 0.457 |
| 2.912256389877696 | 0.974 | 0.533 | 0.406 | 0.666 | 0.457 |
| 2.915397982531286 | 0.975 | 0.533 | 0.406 | 0.666 | 0.457 |
| 2.918539575184875 | 0.975 | 0.533 | 0.406 | 0.666 | 0.457 |
| 2.921681167838465 | 0.976 | 0.533 | 0.406 | 0.666 | 0.457 |
| 2.924822760492054 | 0.977 | 0.533 | 0.406 | 0.666 | 0.457 |
| 2.927964353145644 | 0.977 | 0.533 | 0.406 | 0.666 | 0.457 |
| 2.931105945799234 | 0.978 | 0.533 | 0.406 | 0.666 | 0.457 |
| 2.934247538452823 | 0.979 | 0.533 | 0.406 | 0.666 | 0.457 |
| 2.937389131106413 | 0.979 | 0.533 | 0.406 | 0.666 | 0.457 |
| 2.940530723760002 | 0.98 | 0.533 | 0.406 | 0.666 | 0.457 |
| 2.943672316413592 | 0.98 | 0.533 | 0.406 | 0.666 | 0.457 |
| 2.946813909067182 | 0.981 | 0.533 | 0.406 | 0.666 | 0.457 |
| 2.949955501720771 | 0.982 | 0.533 | 0.406 | 0.666 | 0.457 |
| 2.953097094374361 | 0.982 | 0.533 | 0.406 | 0.666 | 0.457 |
| 2.95623868702795 | 0.983 | 0.533 | 0.406 | 0.666 | 0.457 |
| 2.95938027968154 | 0.983 | 0.533 | 0.406 | 0.666 | 0.457 |
| 2.96252187233513 | 0.984 | 0.533 | 0.406 | 0.666 | 0.457 |
| 2.965663464988719 | 0.985 | 0.533 | 0.406 | 0.666 | 0.457 |
| 2.968805057642309 | 0.985 | 0.533 | 0.406 | 0.666 | 0.457 |
| 2.971946650295898 | 0.986 | 0.533 | 0.406 | 0.666 | 0.457 |
| 2.975088242949488 | 0.986 | 0.533 | 0.406 | 0.666 | 0.457 |
| 2.978229835603078 | 0.987 | 0.533 | 0.406 | 0.666 | 0.457 |
| 2.981371428256667 | 0.987 | 0.533 | 0.406 | 0.667 | 0.457 |
| 2.984513020910257 | 0.988 | 0.533 | 0.406 | 0.667 | 0.457 |
| 2.987654613563846 | 0.988 | 0.533 | 0.406 | 0.667 | 0.457 |
| 2.990796206217436 | 0.989 | 0.533 | 0.406 | 0.667 | 0.457 |
| 2.993937798871025 | 0.989 | 0.533 | 0.406 | 0.667 | 0.457 |
| 2.997079391524615 | 0.99 | 0.533 | 0.406 | 0.667 | 0.457 |
| 3.000220984178205 | 0.99 | 0.533 | 0.406 | 0.667 | 0.457 |
| 3.003362576831794 | 0.99 | 0.533 | 0.406 | 0.667 | 0.457 |
| 3.006504169485384 | 0.991 | 0.533 | 0.406 | 0.667 | 0.457 |
| 3.009645762138974 | 0.991 | 0.533 | 0.406 | 0.667 | 0.457 |
| 3.012787354792563 | 0.992 | 0.533 | 0.406 | 0.667 | 0.457 |
| 3.015928947446153 | 0.992 | 0.533 | 0.406 | 0.667 | 0.457 |
| 3.019070540099742 | 0.993 | 0.533 | 0.406 | 0.667 | 0.457 |
| 3.022212132753332 | 0.993 | 0.533 | 0.406 | 0.667 | 0.457 |
| 3.025353725406922 | 0.993 | 0.533 | 0.406 | 0.667 | 0.457 |
| 3.028495318060511 | 0.994 | 0.533 | 0.406 | 0.667 | 0.457 |
| 3.031636910714101 | 0.994 | 0.533 | 0.406 | 0.667 | 0.457 |
| 3.03477850336769 | 0.994 | 0.533 | 0.406 | 0.667 | 0.457 |
| 3.03792009602128 | 0.995 | 0.533 | 0.406 | 0.667 | 0.457 |
| 3.04106168867487 | 0.995 | 0.533 | 0.406 | 0.667 | 0.457 |
| 3.04420328132846 | 0.995 | 0.533 | 0.406 | 0.667 | 0.457 |
| 3.047344873982049 | 0.996 | 0.533 | 0.406 | 0.667 | 0.457 |
| 3.050486466635638 | 0.996 | 0.533 | 0.406 | 0.667 | 0.457 |
| 3.053628059289228 | 0.996 | 0.533 | 0.406 | 0.667 | 0.457 |
| 3.056769651942818 | 0.996 | 0.533 | 0.406 | 0.667 | 0.457 |
| 3.059911244596407 | 0.997 | 0.533 | 0.406 | 0.667 | 0.457 |
| 3.063052837249997 | 0.997 | 0.533 | 0.406 | 0.667 | 0.457 |
| 3.066194429903586 | 0.997 | 0.533 | 0.406 | 0.667 | 0.457 |
| 3.069336022557176 | 0.997 | 0.533 | 0.406 | 0.667 | 0.457 |
| 3.072477615210766 | 0.998 | 0.533 | 0.406 | 0.667 | 0.457 |
| 3.075619207864355 | 0.998 | 0.533 | 0.406 | 0.667 | 0.457 |
| 3.078760800517945 | 0.998 | 0.533 | 0.406 | 0.667 | 0.457 |
| 3.081902393171534 | 0.998 | 0.533 | 0.406 | 0.667 | 0.457 |
| 3.085043985825124 | 0.998 | 0.533 | 0.406 | 0.667 | 0.457 |
| 3.088185578478713 | 0.999 | 0.533 | 0.406 | 0.667 | 0.457 |
| 3.091327171132303 | 0.999 | 0.533 | 0.406 | 0.667 | 0.457 |
| 3.094468763785893 | 0.999 | 0.533 | 0.406 | 0.667 | 0.457 |
| 3.097610356439482 | 0.999 | 0.533 | 0.406 | 0.667 | 0.457 |
| 3.100751949093072 | 0.999 | 0.533 | 0.406 | 0.667 | 0.457 |
| 3.103893541746661 | 0.999 | 0.533 | 0.406 | 0.667 | 0.457 |
| 3.107035134400251 | 0.999 | 0.533 | 0.406 | 0.667 | 0.457 |
| 3.110176727053841 | 1 | 0.533 | 0.406 | 0.667 | 0.457 |
| 3.11331831970743 | 1 | 0.533 | 0.406 | 0.667 | 0.457 |
| 3.11645991236102 | 1 | 0.533 | 0.406 | 0.667 | 0.457 |
| 3.11960150501461 | 1 | 0.533 | 0.406 | 0.667 | 0.457 |
| 3.122743097668199 | 1 | 0.533 | 0.406 | 0.667 | 0.457 |
| 3.125884690321789 | 1 | 0.533 | 0.406 | 0.667 | 0.457 |
| 3.129026282975378 | 1 | 0.533 | 0.406 | 0.667 | 0.457 |
| 3.132167875628968 | 1 | 0.533 | 0.406 | 0.667 | 0.457 |
| 3.135309468282557 | 1 | 0.533 | 0.406 | 0.667 | 0.457 |
| 3.138451060936147 | 1 | 0.533 | 0.406 | 0.667 | 0.457 |
| 3.141592653589737 | 1 | 0.533 | 0.406 | 0.667 | 0.457 |
| 3.144734246243326 | 1 | 0.533 | 0.406 | 0.667 | 0.457 |
| 3.147875838896916 | 1 | 0.533 | 0.406 | 0.667 | 0.457 |
| 3.151017431550505 | 1 | 0.533 | 0.406 | 0.667 | 0.457 |
| 3.154159024204095 | 1 | 0.533 | 0.406 | 0.667 | 0.457 |
| 3.157300616857685 | 1 | 0.533 | 0.406 | 0.667 | 0.457 |
| 3.160442209511274 | 1 | 0.533 | 0.406 | 0.667 | 0.457 |
| 3.163583802164864 | 1 | 0.533 | 0.406 | 0.667 | 0.457 |
| 3.166725394818453 | 1 | 0.533 | 0.406 | 0.667 | 0.457 |
| 3.169866987472043 | 1 | 0.533 | 0.406 | 0.667 | 0.457 |
| 3.173008580125633 | 1 | 0.533 | 0.406 | 0.667 | 0.457 |
| 3.176150172779222 | 0.999 | 0.533 | 0.406 | 0.667 | 0.457 |
| 3.179291765432812 | 0.999 | 0.533 | 0.406 | 0.667 | 0.457 |
| 3.182433358086401 | 0.999 | 0.533 | 0.406 | 0.667 | 0.457 |
| 3.185574950739991 | 0.999 | 0.533 | 0.406 | 0.667 | 0.457 |
| 3.188716543393581 | 0.999 | 0.533 | 0.406 | 0.667 | 0.457 |
| 3.19185813604717 | 0.999 | 0.533 | 0.406 | 0.667 | 0.457 |
| 3.19499972870076 | 0.999 | 0.533 | 0.406 | 0.667 | 0.457 |
| 3.198141321354349 | 0.998 | 0.533 | 0.406 | 0.667 | 0.457 |
| 3.20128291400794 | 0.998 | 0.533 | 0.406 | 0.667 | 0.457 |
| 3.204424506661528 | 0.998 | 0.533 | 0.406 | 0.667 | 0.457 |
| 3.207566099315118 | 0.998 | 0.533 | 0.406 | 0.667 | 0.457 |
| 3.210707691968708 | 0.998 | 0.533 | 0.406 | 0.667 | 0.457 |
| 3.213849284622297 | 0.997 | 0.533 | 0.406 | 0.667 | 0.457 |
| 3.216990877275887 | 0.997 | 0.533 | 0.406 | 0.667 | 0.457 |
| 3.220132469929476 | 0.997 | 0.533 | 0.406 | 0.667 | 0.457 |
| 3.223274062583066 | 0.997 | 0.533 | 0.406 | 0.667 | 0.457 |
| 3.226415655236656 | 0.996 | 0.533 | 0.406 | 0.667 | 0.457 |
| 3.229557247890245 | 0.996 | 0.533 | 0.406 | 0.667 | 0.457 |
| 3.232698840543835 | 0.996 | 0.533 | 0.406 | 0.667 | 0.457 |
| 3.235840433197425 | 0.996 | 0.533 | 0.406 | 0.667 | 0.457 |
| 3.238982025851014 | 0.995 | 0.533 | 0.406 | 0.667 | 0.457 |
| 3.242123618504604 | 0.995 | 0.533 | 0.406 | 0.667 | 0.457 |
| 3.245265211158193 | 0.995 | 0.533 | 0.406 | 0.667 | 0.457 |
| 3.248406803811783 | 0.994 | 0.533 | 0.406 | 0.667 | 0.457 |
| 3.251548396465373 | 0.994 | 0.533 | 0.406 | 0.667 | 0.457 |
| 3.254689989118962 | 0.994 | 0.533 | 0.406 | 0.667 | 0.457 |
| 3.257831581772551 | 0.993 | 0.533 | 0.406 | 0.667 | 0.457 |
| 3.260973174426141 | 0.993 | 0.533 | 0.406 | 0.667 | 0.457 |
| 3.26411476707973 | 0.993 | 0.533 | 0.406 | 0.667 | 0.457 |
| 3.267256359733321 | 0.992 | 0.533 | 0.406 | 0.667 | 0.457 |
| 3.27039795238691 | 0.992 | 0.533 | 0.406 | 0.667 | 0.457 |
| 3.2735395450405 | 0.991 | 0.533 | 0.406 | 0.667 | 0.457 |
| 3.276681137694089 | 0.991 | 0.533 | 0.406 | 0.667 | 0.457 |
| 3.279822730347679 | 0.99 | 0.533 | 0.406 | 0.667 | 0.457 |
| 3.282964323001269 | 0.99 | 0.533 | 0.406 | 0.667 | 0.457 |
| 3.286105915654858 | 0.99 | 0.533 | 0.406 | 0.667 | 0.457 |
| 3.289247508308448 | 0.989 | 0.533 | 0.406 | 0.667 | 0.457 |
| 3.292389100962037 | 0.989 | 0.533 | 0.406 | 0.667 | 0.457 |
| 3.295530693615627 | 0.988 | 0.533 | 0.406 | 0.667 | 0.457 |
| 3.298672286269217 | 0.988 | 0.533 | 0.406 | 0.667 | 0.457 |
| 3.301813878922806 | 0.987 | 0.533 | 0.406 | 0.667 | 0.457 |
| 3.304955471576396 | 0.987 | 0.533 | 0.406 | 0.666 | 0.457 |
| 3.308097064229985 | 0.986 | 0.533 | 0.406 | 0.666 | 0.457 |
| 3.311238656883575 | 0.986 | 0.533 | 0.406 | 0.666 | 0.457 |
| 3.314380249537165 | 0.985 | 0.533 | 0.406 | 0.666 | 0.457 |
| 3.317521842190754 | 0.985 | 0.533 | 0.406 | 0.666 | 0.457 |
| 3.320663434844344 | 0.984 | 0.533 | 0.406 | 0.666 | 0.457 |
| 3.323805027497933 | 0.983 | 0.533 | 0.406 | 0.666 | 0.457 |
| 3.326946620151523 | 0.983 | 0.533 | 0.406 | 0.666 | 0.457 |
| 3.330088212805113 | 0.982 | 0.533 | 0.406 | 0.666 | 0.457 |
| 3.333229805458702 | 0.982 | 0.533 | 0.406 | 0.666 | 0.457 |
| 3.336371398112292 | 0.981 | 0.533 | 0.406 | 0.666 | 0.457 |
| 3.339512990765881 | 0.98 | 0.533 | 0.406 | 0.666 | 0.457 |
| 3.342654583419471 | 0.98 | 0.533 | 0.406 | 0.666 | 0.457 |
| 3.345796176073061 | 0.979 | 0.533 | 0.406 | 0.666 | 0.457 |
| 3.34893776872665 | 0.979 | 0.533 | 0.406 | 0.666 | 0.457 |
| 3.35207936138024 | 0.978 | 0.533 | 0.406 | 0.666 | 0.457 |
| 3.355220954033829 | 0.977 | 0.533 | 0.406 | 0.666 | 0.457 |
| 3.358362546687419 | 0.977 | 0.533 | 0.406 | 0.666 | 0.457 |
| 3.361504139341009 | 0.976 | 0.533 | 0.406 | 0.666 | 0.457 |
| 3.364645731994598 | 0.975 | 0.533 | 0.406 | 0.666 | 0.457 |
| 3.367787324648188 | 0.975 | 0.533 | 0.406 | 0.666 | 0.457 |
| 3.370928917301777 | 0.974 | 0.533 | 0.406 | 0.666 | 0.457 |
| 3.374070509955367 | 0.973 | 0.533 | 0.406 | 0.666 | 0.457 |
| 3.377212102608956 | 0.972 | 0.533 | 0.406 | 0.666 | 0.457 |
| 3.380353695262546 | 0.972 | 0.533 | 0.406 | 0.666 | 0.457 |
| 3.383495287916136 | 0.971 | 0.533 | 0.406 | 0.666 | 0.457 |
| 3.386636880569725 | 0.97 | 0.533 | 0.406 | 0.666 | 0.457 |
| 3.389778473223315 | 0.969 | 0.533 | 0.406 | 0.666 | 0.457 |
| 3.392920065876904 | 0.969 | 0.533 | 0.406 | 0.666 | 0.457 |
| 3.396061658530494 | 0.968 | 0.533 | 0.406 | 0.666 | 0.457 |
| 3.399203251184084 | 0.967 | 0.533 | 0.406 | 0.666 | 0.457 |
| 3.402344843837673 | 0.966 | 0.533 | 0.406 | 0.666 | 0.457 |
| 3.405486436491263 | 0.965 | 0.533 | 0.406 | 0.665 | 0.457 |
| 3.408628029144852 | 0.965 | 0.533 | 0.406 | 0.665 | 0.457 |
| 3.411769621798442 | 0.964 | 0.533 | 0.406 | 0.665 | 0.457 |
| 3.414911214452032 | 0.963 | 0.533 | 0.406 | 0.665 | 0.457 |
| 3.418052807105621 | 0.962 | 0.533 | 0.406 | 0.665 | 0.457 |
| 3.421194399759211 | 0.961 | 0.533 | 0.406 | 0.665 | 0.457 |
| 3.4243359924128 | 0.96 | 0.533 | 0.406 | 0.665 | 0.457 |
| 3.42747758506639 | 0.959 | 0.533 | 0.406 | 0.665 | 0.457 |
| 3.43061917771998 | 0.959 | 0.533 | 0.406 | 0.665 | 0.457 |
| 3.433760770373569 | 0.958 | 0.533 | 0.406 | 0.665 | 0.457 |
| 3.436902363027159 | 0.957 | 0.533 | 0.406 | 0.665 | 0.457 |
| 3.440043955680748 | 0.956 | 0.533 | 0.406 | 0.665 | 0.457 |
| 3.443185548334338 | 0.955 | 0.533 | 0.406 | 0.665 | 0.457 |
| 3.446327140987927 | 0.954 | 0.533 | 0.406 | 0.665 | 0.457 |
| 3.449468733641517 | 0.953 | 0.533 | 0.406 | 0.664 | 0.457 |
| 3.452610326295107 | 0.952 | 0.533 | 0.406 | 0.664 | 0.457 |
| 3.455751918948696 | 0.951 | 0.533 | 0.406 | 0.664 | 0.457 |
| 3.458893511602286 | 0.95 | 0.533 | 0.406 | 0.664 | 0.457 |
| 3.462035104255876 | 0.949 | 0.533 | 0.406 | 0.664 | 0.457 |
| 3.465176696909465 | 0.948 | 0.533 | 0.406 | 0.664 | 0.457 |
| 3.468318289563055 | 0.947 | 0.533 | 0.406 | 0.664 | 0.457 |
| 3.471459882216644 | 0.946 | 0.533 | 0.406 | 0.664 | 0.457 |
| 3.474601474870234 | 0.945 | 0.533 | 0.406 | 0.664 | 0.457 |
| 3.477743067523824 | 0.944 | 0.533 | 0.406 | 0.664 | 0.457 |
| 3.480884660177413 | 0.943 | 0.533 | 0.406 | 0.663 | 0.457 |
| 3.484026252831002 | 0.942 | 0.533 | 0.406 | 0.663 | 0.457 |
| 3.487167845484592 | 0.941 | 0.533 | 0.406 | 0.663 | 0.457 |
| 3.490309438138182 | 0.94 | 0.533 | 0.406 | 0.663 | 0.457 |
| 3.493451030791772 | 0.939 | 0.533 | 0.406 | 0.663 | 0.457 |
| 3.496592623445361 | 0.938 | 0.533 | 0.406 | 0.663 | 0.457 |
| 3.499734216098951 | 0.937 | 0.533 | 0.406 | 0.663 | 0.457 |
| 3.50287580875254 | 0.935 | 0.533 | 0.406 | 0.663 | 0.457 |
| 3.50601740140613 | 0.934 | 0.533 | 0.406 | 0.662 | 0.457 |
| 3.50915899405972 | 0.933 | 0.533 | 0.406 | 0.662 | 0.457 |
| 3.512300586713309 | 0.932 | 0.533 | 0.406 | 0.662 | 0.457 |
| 3.515442179366899 | 0.931 | 0.533 | 0.406 | 0.662 | 0.457 |
| 3.518583772020488 | 0.93 | 0.533 | 0.406 | 0.662 | 0.457 |
| 3.521725364674078 | 0.929 | 0.533 | 0.406 | 0.662 | 0.457 |
| 3.524866957327668 | 0.927 | 0.533 | 0.406 | 0.662 | 0.457 |
| 3.528008549981257 | 0.926 | 0.533 | 0.406 | 0.661 | 0.457 |
| 3.531150142634847 | 0.925 | 0.533 | 0.406 | 0.661 | 0.457 |
| 3.534291735288436 | 0.924 | 0.533 | 0.406 | 0.661 | 0.457 |
| 3.537433327942026 | 0.923 | 0.533 | 0.406 | 0.661 | 0.457 |
| 3.540574920595616 | 0.921 | 0.533 | 0.406 | 0.661 | 0.457 |
| 3.543716513249205 | 0.92 | 0.533 | 0.406 | 0.66 | 0.457 |
| 3.546858105902795 | 0.919 | 0.533 | 0.406 | 0.66 | 0.457 |
| 3.549999698556384 | 0.918 | 0.533 | 0.406 | 0.66 | 0.457 |
| 3.553141291209974 | 0.917 | 0.533 | 0.406 | 0.66 | 0.457 |
| 3.556282883863564 | 0.915 | 0.533 | 0.406 | 0.66 | 0.457 |
| 3.559424476517153 | 0.914 | 0.533 | 0.406 | 0.659 | 0.457 |
| 3.562566069170743 | 0.913 | 0.533 | 0.406 | 0.659 | 0.457 |
| 3.565707661824332 | 0.911 | 0.532 | 0.406 | 0.659 | 0.457 |
| 3.568849254477922 | 0.91 | 0.532 | 0.406 | 0.659 | 0.457 |
| 3.571990847131511 | 0.909 | 0.532 | 0.406 | 0.659 | 0.457 |
| 3.575132439785101 | 0.907 | 0.532 | 0.406 | 0.658 | 0.457 |
| 3.578274032438691 | 0.906 | 0.532 | 0.406 | 0.658 | 0.457 |
| 3.58141562509228 | 0.905 | 0.532 | 0.406 | 0.658 | 0.457 |
| 3.58455721774587 | 0.903 | 0.532 | 0.406 | 0.658 | 0.457 |
| 3.58769881039946 | 0.902 | 0.532 | 0.406 | 0.657 | 0.457 |
| 3.590840403053049 | 0.901 | 0.532 | 0.406 | 0.657 | 0.457 |
| 3.593981995706639 | 0.899 | 0.532 | 0.406 | 0.657 | 0.457 |
| 3.597123588360228 | 0.898 | 0.532 | 0.406 | 0.657 | 0.457 |
| 3.600265181013818 | 0.897 | 0.532 | 0.406 | 0.656 | 0.457 |
| 3.603406773667407 | 0.895 | 0.532 | 0.406 | 0.656 | 0.457 |
| 3.606548366320997 | 0.894 | 0.532 | 0.406 | 0.656 | 0.457 |
| 3.609689958974587 | 0.892 | 0.532 | 0.406 | 0.656 | 0.457 |
| 3.612831551628176 | 0.891 | 0.532 | 0.406 | 0.655 | 0.457 |
| 3.615973144281766 | 0.89 | 0.532 | 0.406 | 0.655 | 0.457 |
| 3.619114736935355 | 0.888 | 0.532 | 0.406 | 0.655 | 0.457 |
| 3.622256329588945 | 0.887 | 0.532 | 0.406 | 0.654 | 0.457 |
| 3.625397922242534 | 0.885 | 0.531 | 0.406 | 0.654 | 0.457 |
| 3.628539514896124 | 0.884 | 0.531 | 0.406 | 0.654 | 0.457 |
| 3.631681107549714 | 0.882 | 0.531 | 0.406 | 0.653 | 0.457 |
| 3.634822700203303 | 0.881 | 0.531 | 0.406 | 0.653 | 0.457 |
| 3.637964292856893 | 0.879 | 0.531 | 0.406 | 0.653 | 0.457 |
| 3.641105885510483 | 0.878 | 0.531 | 0.406 | 0.652 | 0.457 |
| 3.644247478164072 | 0.876 | 0.531 | 0.406 | 0.652 | 0.457 |
| 3.647389070817662 | 0.875 | 0.531 | 0.406 | 0.652 | 0.457 |
| 3.650530663471251 | 0.873 | 0.531 | 0.406 | 0.651 | 0.457 |
| 3.653672256124841 | 0.872 | 0.531 | 0.406 | 0.651 | 0.457 |
| 3.656813848778431 | 0.87 | 0.531 | 0.406 | 0.651 | 0.457 |
| 3.65995544143202 | 0.869 | 0.531 | 0.406 | 0.65 | 0.457 |
| 3.66309703408561 | 0.867 | 0.531 | 0.406 | 0.65 | 0.457 |
| 3.666238626739199 | 0.866 | 0.53 | 0.406 | 0.649 | 0.457 |
| 3.66938021939279 | 0.864 | 0.53 | 0.406 | 0.649 | 0.457 |
| 3.672521812046378 | 0.862 | 0.53 | 0.406 | 0.649 | 0.457 |
| 3.675663404699968 | 0.861 | 0.53 | 0.406 | 0.648 | 0.457 |
| 3.678804997353558 | 0.859 | 0.53 | 0.406 | 0.648 | 0.456 |
| 3.681946590007147 | 0.858 | 0.53 | 0.406 | 0.647 | 0.456 |
| 3.685088182660737 | 0.856 | 0.53 | 0.406 | 0.647 | 0.456 |
| 3.688229775314326 | 0.854 | 0.53 | 0.406 | 0.646 | 0.456 |
| 3.691371367967916 | 0.853 | 0.53 | 0.406 | 0.646 | 0.456 |
| 3.694512960621506 | 0.851 | 0.529 | 0.406 | 0.646 | 0.456 |
| 3.697654553275095 | 0.849 | 0.529 | 0.406 | 0.645 | 0.456 |
| 3.700796145928685 | 0.848 | 0.529 | 0.406 | 0.645 | 0.456 |
| 3.703937738582274 | 0.846 | 0.529 | 0.406 | 0.644 | 0.456 |
| 3.707079331235864 | 0.844 | 0.529 | 0.406 | 0.644 | 0.456 |
| 3.710220923889454 | 0.843 | 0.529 | 0.406 | 0.643 | 0.456 |
| 3.713362516543043 | 0.841 | 0.529 | 0.406 | 0.643 | 0.456 |
| 3.716504109196633 | 0.839 | 0.528 | 0.406 | 0.642 | 0.456 |
| 3.719645701850223 | 0.838 | 0.528 | 0.406 | 0.642 | 0.456 |
| 3.722787294503812 | 0.836 | 0.528 | 0.406 | 0.641 | 0.456 |
| 3.725928887157402 | 0.834 | 0.528 | 0.406 | 0.641 | 0.456 |
| 3.729070479810991 | 0.832 | 0.528 | 0.406 | 0.64 | 0.456 |
| 3.732212072464581 | 0.831 | 0.528 | 0.406 | 0.64 | 0.456 |
| 3.735353665118171 | 0.829 | 0.527 | 0.406 | 0.639 | 0.456 |
| 3.73849525777176 | 0.827 | 0.527 | 0.406 | 0.638 | 0.456 |
| 3.74163685042535 | 0.825 | 0.527 | 0.406 | 0.638 | 0.456 |
| 3.744778443078939 | 0.824 | 0.527 | 0.406 | 0.637 | 0.456 |
| 3.747920035732529 | 0.822 | 0.527 | 0.406 | 0.637 | 0.456 |
| 3.751061628386119 | 0.82 | 0.527 | 0.406 | 0.636 | 0.455 |
| 3.754203221039708 | 0.818 | 0.526 | 0.406 | 0.636 | 0.455 |
| 3.757344813693298 | 0.816 | 0.526 | 0.406 | 0.635 | 0.455 |
| 3.760486406346887 | 0.815 | 0.526 | 0.406 | 0.634 | 0.455 |
| 3.763627999000477 | 0.813 | 0.526 | 0.406 | 0.634 | 0.455 |
| 3.766769591654067 | 0.811 | 0.526 | 0.406 | 0.633 | 0.455 |
| 3.769911184307656 | 0.809 | 0.525 | 0.406 | 0.633 | 0.455 |
| 3.773052776961246 | 0.807 | 0.525 | 0.406 | 0.632 | 0.455 |
| 3.776194369614835 | 0.805 | 0.525 | 0.406 | 0.631 | 0.455 |
| 3.779335962268425 | 0.803 | 0.525 | 0.406 | 0.631 | 0.455 |
| 3.782477554922014 | 0.802 | 0.524 | 0.406 | 0.63 | 0.455 |
| 3.785619147575604 | 0.8 | 0.524 | 0.406 | 0.629 | 0.455 |
| 3.788760740229193 | 0.798 | 0.524 | 0.406 | 0.629 | 0.455 |
| 3.791902332882783 | 0.796 | 0.524 | 0.406 | 0.628 | 0.454 |
| 3.795043925536373 | 0.794 | 0.523 | 0.406 | 0.627 | 0.454 |
| 3.798185518189962 | 0.792 | 0.523 | 0.405 | 0.626 | 0.454 |
| 3.801327110843552 | 0.79 | 0.523 | 0.405 | 0.626 | 0.454 |
| 3.804468703497142 | 0.788 | 0.523 | 0.405 | 0.625 | 0.454 |
| 3.807610296150731 | 0.786 | 0.522 | 0.405 | 0.624 | 0.454 |
| 3.810751888804321 | 0.784 | 0.522 | 0.405 | 0.624 | 0.454 |
| 3.813893481457911 | 0.782 | 0.522 | 0.405 | 0.623 | 0.454 |
| 3.8170350741115 | 0.78 | 0.521 | 0.405 | 0.622 | 0.454 |
| 3.82017666676509 | 0.778 | 0.521 | 0.405 | 0.621 | 0.453 |
| 3.823318259418679 | 0.776 | 0.521 | 0.405 | 0.62 | 0.453 |
| 3.826459852072269 | 0.775 | 0.521 | 0.405 | 0.62 | 0.453 |
| 3.829601444725859 | 0.773 | 0.52 | 0.405 | 0.619 | 0.453 |
| 3.832743037379448 | 0.771 | 0.52 | 0.405 | 0.618 | 0.453 |
| 3.835884630033038 | 0.769 | 0.52 | 0.405 | 0.617 | 0.453 |
| 3.839026222686627 | 0.766 | 0.519 | 0.405 | 0.616 | 0.453 |
| 3.842167815340217 | 0.764 | 0.519 | 0.405 | 0.616 | 0.453 |
| 3.845309407993807 | 0.762 | 0.518 | 0.405 | 0.615 | 0.452 |
| 3.848451000647396 | 0.76 | 0.518 | 0.405 | 0.614 | 0.452 |
| 3.851592593300986 | 0.758 | 0.518 | 0.405 | 0.613 | 0.452 |
| 3.854734185954575 | 0.756 | 0.517 | 0.405 | 0.612 | 0.452 |
| 3.857875778608165 | 0.754 | 0.517 | 0.404 | 0.611 | 0.452 |
| 3.861017371261755 | 0.752 | 0.517 | 0.404 | 0.61 | 0.452 |
| 3.864158963915344 | 0.75 | 0.516 | 0.404 | 0.609 | 0.451 |
| 3.867300556568933 | 0.748 | 0.516 | 0.404 | 0.609 | 0.451 |
| 3.870442149222523 | 0.746 | 0.515 | 0.404 | 0.608 | 0.451 |
| 3.873583741876112 | 0.744 | 0.515 | 0.404 | 0.607 | 0.451 |
| 3.876725334529703 | 0.742 | 0.515 | 0.404 | 0.606 | 0.451 |
| 3.879866927183292 | 0.74 | 0.514 | 0.404 | 0.605 | 0.451 |
| 3.883008519836882 | 0.738 | 0.514 | 0.404 | 0.604 | 0.45 |
| 3.886150112490471 | 0.735 | 0.513 | 0.404 | 0.603 | 0.45 |
| 3.889291705144061 | 0.733 | 0.513 | 0.404 | 0.602 | 0.45 |
| 3.892433297797651 | 0.731 | 0.512 | 0.404 | 0.601 | 0.45 |
| 3.89557489045124 | 0.729 | 0.512 | 0.403 | 0.6 | 0.449 |
| 3.89871648310483 | 0.727 | 0.511 | 0.403 | 0.599 | 0.449 |
| 3.901858075758419 | 0.725 | 0.511 | 0.403 | 0.598 | 0.449 |
| 3.904999668412009 | 0.722 | 0.51 | 0.403 | 0.597 | 0.449 |
| 3.908141261065598 | 0.72 | 0.51 | 0.403 | 0.596 | 0.449 |
| 3.911282853719188 | 0.718 | 0.509 | 0.403 | 0.595 | 0.448 |
| 3.914424446372778 | 0.716 | 0.509 | 0.403 | 0.594 | 0.448 |
| 3.917566039026367 | 0.714 | 0.508 | 0.403 | 0.593 | 0.448 |
| 3.920707631679957 | 0.712 | 0.508 | 0.403 | 0.591 | 0.448 |
| 3.923849224333547 | 0.709 | 0.507 | 0.402 | 0.59 | 0.447 |
| 3.926990816987136 | 0.707 | 0.507 | 0.402 | 0.589 | 0.447 |
| 3.930132409640726 | 0.705 | 0.506 | 0.402 | 0.588 | 0.447 |
| 3.933274002294315 | 0.703 | 0.506 | 0.402 | 0.587 | 0.446 |
| 3.936415594947905 | 0.7 | 0.505 | 0.402 | 0.586 | 0.446 |
| 3.939557187601495 | 0.698 | 0.504 | 0.402 | 0.585 | 0.446 |
| 3.942698780255084 | 0.696 | 0.504 | 0.401 | 0.584 | 0.446 |
| 3.945840372908674 | 0.694 | 0.503 | 0.401 | 0.582 | 0.445 |
| 3.948981965562263 | 0.691 | 0.503 | 0.401 | 0.581 | 0.445 |
| 3.952123558215853 | 0.689 | 0.502 | 0.401 | 0.58 | 0.445 |
| 3.955265150869442 | 0.687 | 0.501 | 0.401 | 0.579 | 0.444 |
| 3.958406743523032 | 0.685 | 0.501 | 0.401 | 0.578 | 0.444 |
| 3.961548336176622 | 0.682 | 0.5 | 0.4 | 0.576 | 0.444 |
| 3.964689928830211 | 0.68 | 0.499 | 0.4 | 0.575 | 0.443 |
| 3.967831521483801 | 0.678 | 0.499 | 0.4 | 0.574 | 0.443 |
| 3.97097311413739 | 0.675 | 0.498 | 0.4 | 0.573 | 0.442 |
| 3.97411470679098 | 0.673 | 0.497 | 0.4 | 0.571 | 0.442 |
| 3.97725629944457 | 0.671 | 0.497 | 0.399 | 0.57 | 0.442 |
| 3.98039789209816 | 0.668 | 0.496 | 0.399 | 0.569 | 0.441 |
| 3.983539484751749 | 0.666 | 0.495 | 0.399 | 0.568 | 0.441 |
| 3.986681077405338 | 0.664 | 0.495 | 0.399 | 0.566 | 0.441 |
| 3.989822670058928 | 0.661 | 0.494 | 0.399 | 0.565 | 0.44 |
| 3.992964262712517 | 0.659 | 0.493 | 0.398 | 0.564 | 0.44 |
| 3.996105855366107 | 0.657 | 0.492 | 0.398 | 0.562 | 0.439 |
| 3.999247448019697 | 0.654 | 0.492 | 0.398 | 0.561 | 0.439 |
| 4.002389040673287 | 0.652 | 0.491 | 0.398 | 0.56 | 0.438 |
| 4.005530633326877 | 0.649 | 0.49 | 0.397 | 0.558 | 0.438 |
| 4.008672225980466 | 0.647 | 0.489 | 0.397 | 0.557 | 0.437 |
| 4.011813818634056 | 0.645 | 0.488 | 0.397 | 0.555 | 0.437 |
| 4.014955411287645 | 0.642 | 0.487 | 0.396 | 0.554 | 0.436 |
| 4.018097003941234 | 0.64 | 0.487 | 0.396 | 0.553 | 0.436 |
| 4.021238596594824 | 0.637 | 0.486 | 0.396 | 0.551 | 0.435 |
| 4.024380189248414 | 0.635 | 0.485 | 0.396 | 0.55 | 0.435 |
| 4.027521781902004 | 0.633 | 0.484 | 0.395 | 0.548 | 0.434 |
| 4.030663374555593 | 0.63 | 0.483 | 0.395 | 0.547 | 0.434 |
| 4.033804967209183 | 0.628 | 0.482 | 0.395 | 0.545 | 0.433 |
| 4.036946559862773 | 0.625 | 0.481 | 0.394 | 0.544 | 0.433 |
| 4.040088152516362 | 0.623 | 0.48 | 0.394 | 0.542 | 0.432 |
| 4.043229745169951 | 0.62 | 0.48 | 0.394 | 0.541 | 0.432 |
| 4.046371337823541 | 0.618 | 0.479 | 0.393 | 0.539 | 0.431 |
| 4.049512930477131 | 0.615 | 0.478 | 0.393 | 0.538 | 0.431 |
| 4.05265452313072 | 0.613 | 0.477 | 0.392 | 0.536 | 0.43 |
| 4.05579611578431 | 0.61 | 0.476 | 0.392 | 0.535 | 0.429 |
| 4.0589377084379 | 0.608 | 0.475 | 0.392 | 0.533 | 0.429 |
| 4.062079301091489 | 0.605 | 0.474 | 0.391 | 0.531 | 0.428 |
| 4.065220893745079 | 0.603 | 0.473 | 0.391 | 0.53 | 0.427 |
| 4.068362486398668 | 0.6 | 0.472 | 0.391 | 0.528 | 0.427 |
| 4.071504079052258 | 0.598 | 0.471 | 0.39 | 0.527 | 0.426 |
| 4.074645671705848 | 0.595 | 0.47 | 0.39 | 0.525 | 0.425 |
| 4.077787264359437 | 0.593 | 0.469 | 0.389 | 0.523 | 0.425 |
| 4.080928857013027 | 0.59 | 0.468 | 0.389 | 0.522 | 0.424 |
| 4.084070449666616 | 0.588 | 0.466 | 0.388 | 0.52 | 0.423 |
| 4.087212042320206 | 0.585 | 0.465 | 0.388 | 0.518 | 0.423 |
| 4.090353634973795 | 0.583 | 0.464 | 0.387 | 0.517 | 0.422 |
| 4.093495227627385 | 0.58 | 0.463 | 0.387 | 0.515 | 0.421 |
| 4.096636820280975 | 0.578 | 0.462 | 0.386 | 0.513 | 0.42 |
| 4.099778412934564 | 0.575 | 0.461 | 0.386 | 0.512 | 0.42 |
| 4.102920005588154 | 0.572 | 0.46 | 0.385 | 0.51 | 0.419 |
| 4.106061598241744 | 0.57 | 0.459 | 0.385 | 0.508 | 0.418 |
| 4.109203190895333 | 0.567 | 0.457 | 0.384 | 0.506 | 0.417 |
| 4.112344783548923 | 0.565 | 0.456 | 0.384 | 0.505 | 0.416 |
| 4.115486376202512 | 0.562 | 0.455 | 0.383 | 0.503 | 0.416 |
| 4.118627968856102 | 0.559 | 0.454 | 0.383 | 0.501 | 0.415 |
| 4.121769561509692 | 0.557 | 0.452 | 0.382 | 0.499 | 0.414 |
| 4.124911154163281 | 0.554 | 0.451 | 0.381 | 0.498 | 0.413 |
| 4.128052746816871 | 0.552 | 0.45 | 0.381 | 0.496 | 0.412 |
| 4.13119433947046 | 0.549 | 0.449 | 0.38 | 0.494 | 0.411 |
| 4.13433593212405 | 0.546 | 0.447 | 0.38 | 0.492 | 0.41 |
| 4.13747752477764 | 0.544 | 0.446 | 0.379 | 0.49 | 0.409 |
| 4.14061911743123 | 0.541 | 0.445 | 0.378 | 0.488 | 0.409 |
| 4.143760710084818 | 0.538 | 0.443 | 0.378 | 0.486 | 0.408 |
| 4.146902302738408 | 0.536 | 0.442 | 0.377 | 0.485 | 0.407 |
| 4.150043895391998 | 0.533 | 0.441 | 0.376 | 0.483 | 0.406 |
| 4.153185488045588 | 0.531 | 0.439 | 0.375 | 0.481 | 0.405 |
| 4.156327080699177 | 0.528 | 0.438 | 0.375 | 0.479 | 0.404 |
| 4.159468673352766 | 0.525 | 0.437 | 0.374 | 0.477 | 0.403 |
| 4.162610266006356 | 0.522 | 0.435 | 0.373 | 0.475 | 0.402 |
| 4.165751858659946 | 0.52 | 0.434 | 0.373 | 0.473 | 0.401 |
| 4.168893451313535 | 0.517 | 0.432 | 0.372 | 0.471 | 0.4 |
| 4.172035043967125 | 0.514 | 0.431 | 0.371 | 0.469 | 0.399 |
| 4.175176636620715 | 0.512 | 0.429 | 0.37 | 0.467 | 0.397 |
| 4.178318229274304 | 0.509 | 0.428 | 0.369 | 0.465 | 0.396 |
| 4.181459821927894 | 0.506 | 0.426 | 0.369 | 0.463 | 0.395 |
| 4.184601414581484 | 0.504 | 0.425 | 0.368 | 0.461 | 0.394 |
| 4.187743007235073 | 0.501 | 0.423 | 0.367 | 0.459 | 0.393 |
| 4.190884599888663 | 0.498 | 0.422 | 0.366 | 0.457 | 0.392 |
| 4.194026192542252 | 0.495 | 0.42 | 0.365 | 0.455 | 0.391 |
| 4.197167785195842 | 0.493 | 0.419 | 0.364 | 0.453 | 0.39 |
| 4.200309377849432 | 0.49 | 0.417 | 0.363 | 0.451 | 0.388 |
| 4.203450970503021 | 0.487 | 0.416 | 0.362 | 0.449 | 0.387 |
| 4.206592563156611 | 0.485 | 0.414 | 0.361 | 0.447 | 0.386 |
| 4.2097341558102 | 0.482 | 0.412 | 0.361 | 0.444 | 0.385 |
| 4.21287574846379 | 0.479 | 0.411 | 0.36 | 0.442 | 0.383 |
| 4.21601734111738 | 0.476 | 0.409 | 0.359 | 0.44 | 0.382 |
| 4.21915893377097 | 0.473 | 0.407 | 0.358 | 0.438 | 0.381 |
| 4.222300526424559 | 0.471 | 0.406 | 0.357 | 0.436 | 0.38 |
| 4.225442119078148 | 0.468 | 0.404 | 0.356 | 0.434 | 0.378 |
| 4.228583711731738 | 0.465 | 0.402 | 0.355 | 0.432 | 0.377 |
| 4.231725304385327 | 0.462 | 0.401 | 0.353 | 0.429 | 0.376 |
| 4.234866897038917 | 0.46 | 0.399 | 0.352 | 0.427 | 0.374 |
| 4.238008489692506 | 0.457 | 0.397 | 0.351 | 0.425 | 0.373 |
| 4.241150082346096 | 0.454 | 0.395 | 0.35 | 0.423 | 0.371 |
| 4.244291674999685 | 0.451 | 0.394 | 0.349 | 0.421 | 0.37 |
| 4.247433267653276 | 0.448 | 0.392 | 0.348 | 0.418 | 0.369 |
| 4.250574860306865 | 0.446 | 0.39 | 0.347 | 0.416 | 0.367 |
| 4.253716452960455 | 0.443 | 0.388 | 0.346 | 0.414 | 0.366 |
| 4.256858045614044 | 0.44 | 0.386 | 0.344 | 0.412 | 0.364 |
| 4.259999638267634 | 0.437 | 0.385 | 0.343 | 0.409 | 0.363 |
| 4.263141230921224 | 0.434 | 0.383 | 0.342 | 0.407 | 0.361 |
| 4.266282823574813 | 0.431 | 0.381 | 0.341 | 0.405 | 0.36 |
| 4.269424416228403 | 0.429 | 0.379 | 0.34 | 0.402 | 0.358 |
| 4.272566008881992 | 0.426 | 0.377 | 0.338 | 0.4 | 0.357 |
| 4.275707601535582 | 0.423 | 0.375 | 0.337 | 0.398 | 0.355 |
| 4.27884919418917 | 0.42 | 0.373 | 0.336 | 0.395 | 0.353 |
| 4.28199078684276 | 0.417 | 0.371 | 0.334 | 0.393 | 0.352 |
| 4.285132379496351 | 0.414 | 0.369 | 0.333 | 0.391 | 0.35 |
| 4.28827397214994 | 0.412 | 0.367 | 0.332 | 0.388 | 0.349 |
| 4.29141556480353 | 0.409 | 0.365 | 0.33 | 0.386 | 0.347 |
| 4.294557157457119 | 0.406 | 0.363 | 0.329 | 0.384 | 0.345 |
| 4.29769875011071 | 0.403 | 0.361 | 0.327 | 0.381 | 0.344 |
| 4.300840342764299 | 0.4 | 0.359 | 0.326 | 0.379 | 0.342 |
| 4.303981935417888 | 0.397 | 0.357 | 0.325 | 0.376 | 0.34 |
| 4.307123528071478 | 0.394 | 0.355 | 0.323 | 0.374 | 0.338 |
| 4.310265120725067 | 0.391 | 0.353 | 0.322 | 0.371 | 0.337 |
| 4.313406713378657 | 0.388 | 0.351 | 0.32 | 0.369 | 0.335 |
| 4.316548306032247 | 0.386 | 0.349 | 0.319 | 0.366 | 0.333 |
| 4.319689898685836 | 0.383 | 0.347 | 0.317 | 0.364 | 0.331 |
| 4.322831491339426 | 0.38 | 0.345 | 0.316 | 0.362 | 0.33 |
| 4.325973083993015 | 0.377 | 0.343 | 0.314 | 0.359 | 0.328 |
| 4.329114676646605 | 0.374 | 0.341 | 0.312 | 0.357 | 0.326 |
| 4.332256269300195 | 0.371 | 0.338 | 0.311 | 0.354 | 0.324 |
| 4.335397861953784 | 0.368 | 0.336 | 0.309 | 0.351 | 0.322 |
| 4.338539454607374 | 0.365 | 0.334 | 0.308 | 0.349 | 0.32 |
| 4.341681047260963 | 0.362 | 0.332 | 0.306 | 0.346 | 0.318 |
| 4.344822639914553 | 0.359 | 0.33 | 0.304 | 0.344 | 0.316 |
| 4.347964232568143 | 0.356 | 0.327 | 0.303 | 0.341 | 0.314 |
| 4.351105825221732 | 0.353 | 0.325 | 0.301 | 0.339 | 0.313 |
| 4.354247417875322 | 0.351 | 0.323 | 0.299 | 0.336 | 0.311 |
| 4.357389010528911 | 0.348 | 0.321 | 0.297 | 0.334 | 0.309 |
| 4.360530603182501 | 0.345 | 0.318 | 0.296 | 0.331 | 0.307 |
| 4.36367219583609 | 0.342 | 0.316 | 0.294 | 0.328 | 0.305 |
| 4.36681378848968 | 0.339 | 0.314 | 0.292 | 0.326 | 0.302 |
| 4.36995538114327 | 0.336 | 0.311 | 0.29 | 0.323 | 0.3 |
| 4.373096973796859 | 0.333 | 0.309 | 0.288 | 0.321 | 0.298 |
| 4.376238566450449 | 0.33 | 0.307 | 0.286 | 0.318 | 0.296 |
| 4.379380159104038 | 0.327 | 0.304 | 0.285 | 0.315 | 0.294 |
| 4.382521751757628 | 0.324 | 0.302 | 0.283 | 0.313 | 0.292 |
| 4.385663344411217 | 0.321 | 0.3 | 0.281 | 0.31 | 0.29 |
| 4.388804937064807 | 0.318 | 0.297 | 0.279 | 0.307 | 0.288 |
| 4.391946529718397 | 0.315 | 0.295 | 0.277 | 0.305 | 0.286 |
| 4.395088122371987 | 0.312 | 0.292 | 0.275 | 0.302 | 0.283 |
| 4.398229715025576 | 0.309 | 0.29 | 0.273 | 0.299 | 0.281 |
| 4.401371307679165 | 0.306 | 0.287 | 0.271 | 0.296 | 0.279 |
| 4.404512900332755 | 0.303 | 0.285 | 0.269 | 0.294 | 0.277 |
| 4.407654492986345 | 0.3 | 0.283 | 0.267 | 0.291 | 0.274 |
| 4.410796085639934 | 0.297 | 0.28 | 0.265 | 0.288 | 0.272 |
| 4.413937678293524 | 0.294 | 0.278 | 0.263 | 0.286 | 0.27 |
| 4.417079270947114 | 0.291 | 0.275 | 0.261 | 0.283 | 0.268 |
| 4.420220863600703 | 0.288 | 0.272 | 0.258 | 0.28 | 0.265 |
| 4.423362456254293 | 0.285 | 0.27 | 0.256 | 0.277 | 0.263 |
| 4.426504048907883 | 0.282 | 0.267 | 0.254 | 0.275 | 0.261 |
| 4.429645641561472 | 0.279 | 0.265 | 0.252 | 0.272 | 0.258 |
| 4.432787234215062 | 0.276 | 0.262 | 0.25 | 0.269 | 0.256 |
| 4.435928826868651 | 0.273 | 0.26 | 0.248 | 0.266 | 0.254 |
| 4.43907041952224 | 0.27 | 0.257 | 0.245 | 0.263 | 0.251 |
| 4.44221201217583 | 0.267 | 0.254 | 0.243 | 0.261 | 0.249 |
| 4.44535360482942 | 0.264 | 0.252 | 0.241 | 0.258 | 0.246 |
| 4.44849519748301 | 0.261 | 0.249 | 0.239 | 0.255 | 0.244 |
| 4.4516367901366 | 0.258 | 0.247 | 0.236 | 0.252 | 0.241 |
| 4.454778382790188 | 0.255 | 0.244 | 0.234 | 0.249 | 0.239 |
| 4.457919975443779 | 0.252 | 0.241 | 0.232 | 0.246 | 0.236 |
| 4.461061568097368 | 0.249 | 0.239 | 0.229 | 0.244 | 0.234 |
| 4.464203160750958 | 0.246 | 0.236 | 0.227 | 0.241 | 0.231 |
| 4.467344753404547 | 0.243 | 0.233 | 0.225 | 0.238 | 0.229 |
| 4.470486346058137 | 0.24 | 0.231 | 0.222 | 0.235 | 0.226 |
| 4.473627938711726 | 0.236 | 0.228 | 0.22 | 0.232 | 0.224 |
| 4.476769531365316 | 0.233 | 0.225 | 0.217 | 0.229 | 0.221 |
| 4.479911124018905 | 0.23 | 0.222 | 0.215 | 0.226 | 0.219 |
| 4.483052716672495 | 0.227 | 0.22 | 0.212 | 0.223 | 0.216 |
| 4.486194309326085 | 0.224 | 0.217 | 0.21 | 0.221 | 0.213 |
| 4.489335901979674 | 0.221 | 0.214 | 0.207 | 0.218 | 0.211 |
| 4.492477494633264 | 0.218 | 0.211 | 0.205 | 0.215 | 0.208 |
| 4.495619087286854 | 0.215 | 0.209 | 0.202 | 0.212 | 0.205 |
| 4.498760679940443 | 0.212 | 0.206 | 0.2 | 0.209 | 0.203 |
| 4.501902272594033 | 0.209 | 0.203 | 0.197 | 0.206 | 0.2 |
| 4.505043865247622 | 0.206 | 0.2 | 0.195 | 0.203 | 0.197 |
| 4.508185457901212 | 0.203 | 0.197 | 0.192 | 0.2 | 0.195 |
| 4.511327050554801 | 0.2 | 0.194 | 0.189 | 0.197 | 0.192 |
| 4.514468643208391 | 0.197 | 0.192 | 0.187 | 0.194 | 0.189 |
| 4.517610235861981 | 0.194 | 0.189 | 0.184 | 0.191 | 0.186 |
| 4.520751828515571 | 0.19 | 0.186 | 0.182 | 0.188 | 0.184 |
| 4.52389342116916 | 0.187 | 0.183 | 0.179 | 0.185 | 0.181 |
| 4.52703501382275 | 0.184 | 0.18 | 0.176 | 0.182 | 0.178 |
| 4.530176606476339 | 0.181 | 0.177 | 0.174 | 0.179 | 0.175 |
| 4.533318199129928 | 0.178 | 0.174 | 0.171 | 0.176 | 0.173 |
| 4.536459791783518 | 0.175 | 0.171 | 0.168 | 0.173 | 0.17 |
| 4.539601384437108 | 0.172 | 0.169 | 0.165 | 0.17 | 0.167 |
| 4.542742977090698 | 0.169 | 0.166 | 0.163 | 0.167 | 0.164 |
| 4.545884569744287 | 0.166 | 0.163 | 0.16 | 0.164 | 0.161 |
| 4.549026162397876 | 0.163 | 0.16 | 0.157 | 0.161 | 0.158 |
| 4.552167755051466 | 0.16 | 0.157 | 0.154 | 0.158 | 0.156 |
| 4.555309347705056 | 0.156 | 0.154 | 0.151 | 0.155 | 0.153 |
| 4.558450940358646 | 0.153 | 0.151 | 0.149 | 0.152 | 0.15 |
| 4.561592533012235 | 0.15 | 0.148 | 0.146 | 0.149 | 0.147 |
| 4.564734125665825 | 0.147 | 0.145 | 0.143 | 0.146 | 0.144 |
| 4.567875718319415 | 0.144 | 0.142 | 0.14 | 0.143 | 0.141 |
| 4.571017310973004 | 0.141 | 0.139 | 0.137 | 0.14 | 0.138 |
| 4.574158903626594 | 0.138 | 0.136 | 0.134 | 0.137 | 0.135 |
| 4.577300496280183 | 0.135 | 0.133 | 0.131 | 0.134 | 0.132 |
| 4.580442088933772 | 0.132 | 0.13 | 0.129 | 0.131 | 0.129 |
| 4.583583681587362 | 0.128 | 0.127 | 0.126 | 0.128 | 0.126 |
| 4.586725274240952 | 0.125 | 0.124 | 0.123 | 0.125 | 0.123 |
| 4.589866866894542 | 0.122 | 0.121 | 0.12 | 0.122 | 0.12 |
| 4.593008459548131 | 0.119 | 0.118 | 0.117 | 0.119 | 0.117 |
| 4.596150052201721 | 0.116 | 0.115 | 0.114 | 0.115 | 0.114 |
| 4.59929164485531 | 0.113 | 0.112 | 0.111 | 0.112 | 0.111 |
| 4.6024332375089 | 0.11 | 0.109 | 0.108 | 0.109 | 0.108 |
| 4.60557483016249 | 0.107 | 0.106 | 0.105 | 0.106 | 0.105 |
| 4.608716422816079 | 0.103 | 0.103 | 0.102 | 0.103 | 0.102 |
| 4.611858015469668 | 0.1 | 0.1 | 0.099 | 0.1 | 0.099 |
| 4.614999608123258 | 0.097 | 0.097 | 0.096 | 0.097 | 0.096 |
| 4.618141200776848 | 0.094 | 0.094 | 0.093 | 0.094 | 0.093 |
| 4.621282793430437 | 0.091 | 0.09 | 0.09 | 0.091 | 0.09 |
| 4.624424386084027 | 0.088 | 0.087 | 0.087 | 0.088 | 0.087 |
| 4.627565978737617 | 0.085 | 0.084 | 0.084 | 0.085 | 0.084 |
| 4.630707571391206 | 0.082 | 0.081 | 0.081 | 0.081 | 0.081 |
| 4.633849164044795 | 0.078 | 0.078 | 0.078 | 0.078 | 0.078 |
| 4.636990756698386 | 0.075 | 0.075 | 0.075 | 0.075 | 0.075 |
| 4.640132349351975 | 0.072 | 0.072 | 0.072 | 0.072 | 0.072 |
| 4.643273942005564 | 0.069 | 0.069 | 0.069 | 0.069 | 0.069 |
| 4.646415534659154 | 0.066 | 0.066 | 0.066 | 0.066 | 0.066 |
| 4.649557127312744 | 0.063 | 0.063 | 0.062 | 0.063 | 0.063 |
| 4.652698719966334 | 0.06 | 0.06 | 0.059 | 0.06 | 0.059 |
| 4.655840312619923 | 0.057 | 0.056 | 0.056 | 0.056 | 0.056 |
| 4.658981905273513 | 0.053 | 0.053 | 0.053 | 0.053 | 0.053 |
| 4.662123497927102 | 0.05 | 0.05 | 0.05 | 0.05 | 0.05 |
| 4.665265090580692 | 0.047 | 0.047 | 0.047 | 0.047 | 0.047 |
| 4.668406683234282 | 0.044 | 0.044 | 0.044 | 0.044 | 0.044 |
| 4.671548275887871 | 0.041 | 0.041 | 0.041 | 0.041 | 0.041 |
| 4.674689868541461 | 0.038 | 0.038 | 0.038 | 0.038 | 0.038 |
| 4.67783146119505 | 0.035 | 0.035 | 0.034 | 0.035 | 0.035 |
| 4.68097305384864 | 0.031 | 0.031 | 0.031 | 0.031 | 0.031 |
| 4.68411464650223 | 0.028 | 0.028 | 0.028 | 0.028 | 0.028 |
| 4.687256239155819 | 0.025 | 0.025 | 0.025 | 0.025 | 0.025 |
| 4.690397831809409 | 0.022 | 0.022 | 0.022 | 0.022 | 0.022 |
| 4.693539424462998 | 0.019 | 0.019 | 0.019 | 0.019 | 0.019 |
| 4.696681017116588 | 0.016 | 0.016 | 0.016 | 0.016 | 0.016 |
| 4.699822609770177 | 0.013 | 0.013 | 0.013 | 0.013 | 0.013 |
| 4.702964202423767 | 0.009 | 0.009 | 0.009 | 0.009 | 0.009 |
| 4.706105795077356 | 0.006 | 0.006 | 0.006 | 0.006 | 0.006 |
| 4.709247387730946 | 0.003 | 0.003 | 0.003 | 0.003 | 0.003 |
| 4.712388980384535 | 0 | 0 | 0 | 0 | 0 |
| 4.715530573038126 | -0.003 | -0.003 | -0.003 | -0.003 | -0.003 |
| 4.718672165691715 | -0.006 | -0.006 | -0.006 | -0.006 | -0.006 |
| 4.721813758345305 | -0.009 | -0.009 | -0.009 | -0.009 | -0.009 |
| 4.724955350998894 | -0.013 | -0.013 | -0.013 | -0.013 | -0.013 |
| 4.728096943652484 | -0.016 | -0.016 | -0.016 | -0.016 | -0.016 |
| 4.731238536306074 | -0.019 | -0.019 | -0.019 | -0.019 | -0.019 |
| 4.734380128959663 | -0.022 | -0.022 | -0.022 | -0.022 | -0.022 |
| 4.737521721613253 | -0.025 | -0.025 | -0.025 | -0.025 | -0.025 |
| 4.740663314266842 | -0.028 | -0.028 | -0.028 | -0.028 | -0.028 |
| 4.743804906920432 | -0.031 | -0.031 | -0.031 | -0.031 | -0.031 |
| 4.74694649957402 | -0.035 | -0.035 | -0.034 | -0.035 | -0.035 |
| 4.750088092227611 | -0.038 | -0.038 | -0.038 | -0.038 | -0.038 |
| 4.7532296848812 | -0.041 | -0.041 | -0.041 | -0.041 | -0.041 |
| 4.75637127753479 | -0.044 | -0.044 | -0.044 | -0.044 | -0.044 |
| 4.75951287018838 | -0.047 | -0.047 | -0.047 | -0.047 | -0.047 |
| 4.76265446284197 | -0.05 | -0.05 | -0.05 | -0.05 | -0.05 |
| 4.765796055495559 | -0.053 | -0.053 | -0.053 | -0.053 | -0.053 |
| 4.768937648149149 | -0.057 | -0.056 | -0.056 | -0.056 | -0.056 |
| 4.772079240802738 | -0.06 | -0.06 | -0.059 | -0.06 | -0.059 |
| 4.775220833456327 | -0.063 | -0.063 | -0.062 | -0.063 | -0.063 |
| 4.778362426109917 | -0.066 | -0.066 | -0.066 | -0.066 | -0.066 |
| 4.781504018763507 | -0.069 | -0.069 | -0.069 | -0.069 | -0.069 |
| 4.784645611417097 | -0.072 | -0.072 | -0.072 | -0.072 | -0.072 |
| 4.787787204070686 | -0.075 | -0.075 | -0.075 | -0.075 | -0.075 |
| 4.790928796724275 | -0.078 | -0.078 | -0.078 | -0.078 | -0.078 |
| 4.794070389377865 | -0.082 | -0.081 | -0.081 | -0.081 | -0.081 |
| 4.797211982031455 | -0.085 | -0.084 | -0.084 | -0.085 | -0.084 |
| 4.800353574685045 | -0.088 | -0.087 | -0.087 | -0.088 | -0.087 |
| 4.803495167338634 | -0.091 | -0.09 | -0.09 | -0.091 | -0.09 |
| 4.806636759992224 | -0.094 | -0.094 | -0.093 | -0.094 | -0.093 |
| 4.809778352645814 | -0.097 | -0.097 | -0.096 | -0.097 | -0.096 |
| 4.812919945299403 | -0.1 | -0.1 | -0.099 | -0.1 | -0.099 |
| 4.816061537952993 | -0.103 | -0.103 | -0.102 | -0.103 | -0.102 |
| 4.819203130606582 | -0.107 | -0.106 | -0.105 | -0.106 | -0.105 |
| 4.822344723260172 | -0.11 | -0.109 | -0.108 | -0.109 | -0.108 |
| 4.825486315913761 | -0.113 | -0.112 | -0.111 | -0.112 | -0.111 |
| 4.828627908567351 | -0.116 | -0.115 | -0.114 | -0.115 | -0.114 |
| 4.83176950122094 | -0.119 | -0.118 | -0.117 | -0.119 | -0.117 |
| 4.83491109387453 | -0.122 | -0.121 | -0.12 | -0.122 | -0.12 |
| 4.83805268652812 | -0.125 | -0.124 | -0.123 | -0.125 | -0.123 |
| 4.841194279181709 | -0.128 | -0.127 | -0.126 | -0.128 | -0.126 |
| 4.844335871835299 | -0.132 | -0.13 | -0.129 | -0.131 | -0.129 |
| 4.847477464488889 | -0.135 | -0.133 | -0.131 | -0.134 | -0.132 |
| 4.850619057142478 | -0.138 | -0.136 | -0.134 | -0.137 | -0.135 |
| 4.853760649796068 | -0.141 | -0.139 | -0.137 | -0.14 | -0.138 |
| 4.856902242449657 | -0.144 | -0.142 | -0.14 | -0.143 | -0.141 |
| 4.860043835103247 | -0.147 | -0.145 | -0.143 | -0.146 | -0.144 |
| 4.863185427756837 | -0.15 | -0.148 | -0.146 | -0.149 | -0.147 |
| 4.866327020410426 | -0.153 | -0.151 | -0.149 | -0.152 | -0.15 |
| 4.869468613064015 | -0.156 | -0.154 | -0.151 | -0.155 | -0.153 |
| 4.872610205717605 | -0.16 | -0.157 | -0.154 | -0.158 | -0.156 |
| 4.875751798371195 | -0.163 | -0.16 | -0.157 | -0.161 | -0.158 |
| 4.878893391024784 | -0.166 | -0.163 | -0.16 | -0.164 | -0.161 |
| 4.882034983678374 | -0.169 | -0.166 | -0.163 | -0.167 | -0.164 |
| 4.885176576331964 | -0.172 | -0.169 | -0.165 | -0.17 | -0.167 |
| 4.888318168985553 | -0.175 | -0.171 | -0.168 | -0.173 | -0.17 |
| 4.891459761639143 | -0.178 | -0.174 | -0.171 | -0.176 | -0.173 |
| 4.894601354292733 | -0.181 | -0.177 | -0.174 | -0.179 | -0.175 |
| 4.897742946946322 | -0.184 | -0.18 | -0.176 | -0.182 | -0.178 |
| 4.900884539599912 | -0.187 | -0.183 | -0.179 | -0.185 | -0.181 |
| 4.904026132253501 | -0.19 | -0.186 | -0.182 | -0.188 | -0.184 |
| 4.907167724907091 | -0.194 | -0.189 | -0.184 | -0.191 | -0.186 |
| 4.91030931756068 | -0.197 | -0.192 | -0.187 | -0.194 | -0.189 |
| 4.91345091021427 | -0.2 | -0.194 | -0.189 | -0.197 | -0.192 |
| 4.91659250286786 | -0.203 | -0.197 | -0.192 | -0.2 | -0.195 |
| 4.91973409552145 | -0.206 | -0.2 | -0.195 | -0.203 | -0.197 |
| 4.922875688175039 | -0.209 | -0.203 | -0.197 | -0.206 | -0.2 |
| 4.926017280828628 | -0.212 | -0.206 | -0.2 | -0.209 | -0.203 |
| 4.929158873482218 | -0.215 | -0.209 | -0.202 | -0.212 | -0.205 |
| 4.932300466135808 | -0.218 | -0.211 | -0.205 | -0.215 | -0.208 |
| 4.935442058789397 | -0.221 | -0.214 | -0.207 | -0.218 | -0.211 |
| 4.938583651442987 | -0.224 | -0.217 | -0.21 | -0.221 | -0.213 |
| 4.941725244096576 | -0.227 | -0.22 | -0.212 | -0.223 | -0.216 |
| 4.944866836750166 | -0.23 | -0.222 | -0.215 | -0.226 | -0.219 |
| 4.948008429403755 | -0.233 | -0.225 | -0.217 | -0.229 | -0.221 |
| 4.951150022057345 | -0.236 | -0.228 | -0.22 | -0.232 | -0.224 |
| 4.954291614710935 | -0.24 | -0.231 | -0.222 | -0.235 | -0.226 |
| 4.957433207364524 | -0.243 | -0.233 | -0.225 | -0.238 | -0.229 |
| 4.960574800018114 | -0.246 | -0.236 | -0.227 | -0.241 | -0.231 |
| 4.963716392671704 | -0.249 | -0.239 | -0.229 | -0.244 | -0.234 |
| 4.966857985325293 | -0.252 | -0.241 | -0.232 | -0.246 | -0.236 |
| 4.969999577978883 | -0.255 | -0.244 | -0.234 | -0.249 | -0.239 |
| 4.973141170632472 | -0.258 | -0.247 | -0.236 | -0.252 | -0.241 |
| 4.976282763286062 | -0.261 | -0.249 | -0.239 | -0.255 | -0.244 |
| 4.979424355939651 | -0.264 | -0.252 | -0.241 | -0.258 | -0.246 |
| 4.982565948593241 | -0.267 | -0.254 | -0.243 | -0.261 | -0.249 |
| 4.985707541246831 | -0.27 | -0.257 | -0.245 | -0.263 | -0.251 |
| 4.98884913390042 | -0.273 | -0.26 | -0.248 | -0.266 | -0.254 |
| 4.99199072655401 | -0.276 | -0.262 | -0.25 | -0.269 | -0.256 |
| 4.9951323192076 | -0.279 | -0.265 | -0.252 | -0.272 | -0.258 |
| 4.99827391186119 | -0.282 | -0.267 | -0.254 | -0.275 | -0.261 |
| 5.00141550451478 | -0.285 | -0.27 | -0.256 | -0.277 | -0.263 |
| 5.004557097168369 | -0.288 | -0.272 | -0.258 | -0.28 | -0.265 |
| 5.007698689821958 | -0.291 | -0.275 | -0.261 | -0.283 | -0.268 |
| 5.010840282475548 | -0.294 | -0.278 | -0.263 | -0.286 | -0.27 |
| 5.013981875129137 | -0.297 | -0.28 | -0.265 | -0.288 | -0.272 |
| 5.017123467782727 | -0.3 | -0.283 | -0.267 | -0.291 | -0.274 |
| 5.020265060436317 | -0.303 | -0.285 | -0.269 | -0.294 | -0.277 |
| 5.023406653089906 | -0.306 | -0.287 | -0.271 | -0.296 | -0.279 |
| 5.026548245743496 | -0.309 | -0.29 | -0.273 | -0.299 | -0.281 |
| 5.029689838397085 | -0.312 | -0.292 | -0.275 | -0.302 | -0.283 |
| 5.032831431050674 | -0.315 | -0.295 | -0.277 | -0.305 | -0.286 |
| 5.035973023704264 | -0.318 | -0.297 | -0.279 | -0.307 | -0.288 |
| 5.039114616357854 | -0.321 | -0.3 | -0.281 | -0.31 | -0.29 |
| 5.042256209011444 | -0.324 | -0.302 | -0.283 | -0.313 | -0.292 |
| 5.045397801665033 | -0.327 | -0.304 | -0.285 | -0.315 | -0.294 |
| 5.048539394318622 | -0.33 | -0.307 | -0.286 | -0.318 | -0.296 |
| 5.051680986972213 | -0.333 | -0.309 | -0.288 | -0.321 | -0.298 |
| 5.054822579625802 | -0.336 | -0.311 | -0.29 | -0.323 | -0.3 |
| 5.057964172279392 | -0.339 | -0.314 | -0.292 | -0.326 | -0.302 |
| 5.061105764932981 | -0.342 | -0.316 | -0.294 | -0.328 | -0.305 |
| 5.064247357586571 | -0.345 | -0.318 | -0.296 | -0.331 | -0.307 |
| 5.067388950240161 | -0.348 | -0.321 | -0.297 | -0.334 | -0.309 |
| 5.07053054289375 | -0.351 | -0.323 | -0.299 | -0.336 | -0.311 |
| 5.07367213554734 | -0.353 | -0.325 | -0.301 | -0.339 | -0.313 |
| 5.07681372820093 | -0.356 | -0.327 | -0.303 | -0.341 | -0.314 |
| 5.079955320854519 | -0.359 | -0.33 | -0.304 | -0.344 | -0.316 |
| 5.083096913508108 | -0.362 | -0.332 | -0.306 | -0.346 | -0.318 |
| 5.086238506161698 | -0.365 | -0.334 | -0.308 | -0.349 | -0.32 |
| 5.089380098815288 | -0.368 | -0.336 | -0.309 | -0.351 | -0.322 |
| 5.092521691468877 | -0.371 | -0.338 | -0.311 | -0.354 | -0.324 |
| 5.095663284122466 | -0.374 | -0.341 | -0.312 | -0.357 | -0.326 |
| 5.098804876776057 | -0.377 | -0.343 | -0.314 | -0.359 | -0.328 |
| 5.101946469429646 | -0.38 | -0.345 | -0.316 | -0.362 | -0.33 |
| 5.105088062083236 | -0.383 | -0.347 | -0.317 | -0.364 | -0.331 |
| 5.108229654736825 | -0.386 | -0.349 | -0.319 | -0.366 | -0.333 |
| 5.111371247390415 | -0.388 | -0.351 | -0.32 | -0.369 | -0.335 |
| 5.114512840044005 | -0.391 | -0.353 | -0.322 | -0.371 | -0.337 |
| 5.117654432697594 | -0.394 | -0.355 | -0.323 | -0.374 | -0.338 |
| 5.120796025351184 | -0.397 | -0.357 | -0.325 | -0.376 | -0.34 |
| 5.123937618004773 | -0.4 | -0.359 | -0.326 | -0.379 | -0.342 |
| 5.127079210658363 | -0.403 | -0.361 | -0.327 | -0.381 | -0.344 |
| 5.130220803311953 | -0.406 | -0.363 | -0.329 | -0.384 | -0.345 |
| 5.133362395965542 | -0.409 | -0.365 | -0.33 | -0.386 | -0.347 |
| 5.136503988619131 | -0.412 | -0.367 | -0.332 | -0.388 | -0.349 |
| 5.13964558127272 | -0.414 | -0.369 | -0.333 | -0.391 | -0.35 |
| 5.142787173926311 | -0.417 | -0.371 | -0.334 | -0.393 | -0.352 |
| 5.1459287665799 | -0.42 | -0.373 | -0.336 | -0.395 | -0.353 |
| 5.14907035923349 | -0.423 | -0.375 | -0.337 | -0.398 | -0.355 |
| 5.15221195188708 | -0.426 | -0.377 | -0.338 | -0.4 | -0.357 |
| 5.15535354454067 | -0.429 | -0.379 | -0.34 | -0.402 | -0.358 |
| 5.158495137194259 | -0.431 | -0.381 | -0.341 | -0.405 | -0.36 |
| 5.161636729847848 | -0.434 | -0.383 | -0.342 | -0.407 | -0.361 |
| 5.164778322501438 | -0.437 | -0.385 | -0.343 | -0.409 | -0.363 |
| 5.167919915155028 | -0.44 | -0.386 | -0.344 | -0.412 | -0.364 |
| 5.171061507808617 | -0.443 | -0.388 | -0.346 | -0.414 | -0.366 |
| 5.174203100462206 | -0.446 | -0.39 | -0.347 | -0.416 | -0.367 |
| 5.177344693115796 | -0.448 | -0.392 | -0.348 | -0.418 | -0.369 |
| 5.180486285769386 | -0.451 | -0.394 | -0.349 | -0.421 | -0.37 |
| 5.183627878422976 | -0.454 | -0.395 | -0.35 | -0.423 | -0.371 |
| 5.186769471076565 | -0.457 | -0.397 | -0.351 | -0.425 | -0.373 |
| 5.189911063730155 | -0.46 | -0.399 | -0.352 | -0.427 | -0.374 |
| 5.193052656383744 | -0.462 | -0.401 | -0.353 | -0.429 | -0.376 |
| 5.196194249037334 | -0.465 | -0.402 | -0.355 | -0.432 | -0.377 |
| 5.199335841690924 | -0.468 | -0.404 | -0.356 | -0.434 | -0.378 |
| 5.202477434344513 | -0.471 | -0.406 | -0.357 | -0.436 | -0.38 |
| 5.205619026998103 | -0.473 | -0.407 | -0.358 | -0.438 | -0.381 |
| 5.208760619651692 | -0.476 | -0.409 | -0.359 | -0.44 | -0.382 |
| 5.211902212305282 | -0.479 | -0.411 | -0.36 | -0.442 | -0.383 |
| 5.215043804958871 | -0.482 | -0.412 | -0.361 | -0.444 | -0.385 |
| 5.218185397612461 | -0.485 | -0.414 | -0.361 | -0.447 | -0.386 |
| 5.221326990266051 | -0.487 | -0.416 | -0.362 | -0.449 | -0.387 |
| 5.22446858291964 | -0.49 | -0.417 | -0.363 | -0.451 | -0.388 |
| 5.22761017557323 | -0.493 | -0.419 | -0.364 | -0.453 | -0.39 |
| 5.23075176822682 | -0.495 | -0.42 | -0.365 | -0.455 | -0.391 |
| 5.23389336088041 | -0.498 | -0.422 | -0.366 | -0.457 | -0.392 |
| 5.237034953533999 | -0.501 | -0.423 | -0.367 | -0.459 | -0.393 |
| 5.240176546187588 | -0.504 | -0.425 | -0.368 | -0.461 | -0.394 |
| 5.243318138841178 | -0.506 | -0.426 | -0.369 | -0.463 | -0.395 |
| 5.246459731494767 | -0.509 | -0.428 | -0.369 | -0.465 | -0.396 |
| 5.249601324148357 | -0.512 | -0.429 | -0.37 | -0.467 | -0.397 |
| 5.252742916801947 | -0.514 | -0.431 | -0.371 | -0.469 | -0.399 |
| 5.255884509455536 | -0.517 | -0.432 | -0.372 | -0.471 | -0.4 |
| 5.259026102109125 | -0.52 | -0.434 | -0.373 | -0.473 | -0.401 |
| 5.262167694762715 | -0.522 | -0.435 | -0.373 | -0.475 | -0.402 |
| 5.265309287416305 | -0.525 | -0.437 | -0.374 | -0.477 | -0.403 |
| 5.268450880069895 | -0.528 | -0.438 | -0.375 | -0.479 | -0.404 |
| 5.271592472723484 | -0.531 | -0.439 | -0.375 | -0.481 | -0.405 |
| 5.274734065377074 | -0.533 | -0.441 | -0.376 | -0.483 | -0.406 |
| 5.277875658030664 | -0.536 | -0.442 | -0.377 | -0.485 | -0.407 |
| 5.281017250684253 | -0.538 | -0.443 | -0.378 | -0.486 | -0.408 |
| 5.284158843337843 | -0.541 | -0.445 | -0.378 | -0.488 | -0.409 |
| 5.287300435991432 | -0.544 | -0.446 | -0.379 | -0.49 | -0.409 |
| 5.290442028645022 | -0.546 | -0.447 | -0.38 | -0.492 | -0.41 |
| 5.293583621298612 | -0.549 | -0.449 | -0.38 | -0.494 | -0.411 |
| 5.296725213952201 | -0.552 | -0.45 | -0.381 | -0.496 | -0.412 |
| 5.299866806605791 | -0.554 | -0.451 | -0.381 | -0.498 | -0.413 |
| 5.30300839925938 | -0.557 | -0.452 | -0.382 | -0.499 | -0.414 |
| 5.30614999191297 | -0.559 | -0.454 | -0.383 | -0.501 | -0.415 |
| 5.30929158456656 | -0.562 | -0.455 | -0.383 | -0.503 | -0.416 |
| 5.312433177220149 | -0.565 | -0.456 | -0.384 | -0.505 | -0.416 |
| 5.315574769873739 | -0.567 | -0.457 | -0.384 | -0.506 | -0.417 |
| 5.318716362527328 | -0.57 | -0.459 | -0.385 | -0.508 | -0.418 |
| 5.321857955180918 | -0.572 | -0.46 | -0.385 | -0.51 | -0.419 |
| 5.324999547834508 | -0.575 | -0.461 | -0.386 | -0.512 | -0.42 |
| 5.328141140488097 | -0.578 | -0.462 | -0.386 | -0.513 | -0.42 |
| 5.331282733141686 | -0.58 | -0.463 | -0.387 | -0.515 | -0.421 |
| 5.334424325795276 | -0.583 | -0.464 | -0.387 | -0.517 | -0.422 |
| 5.337565918448866 | -0.585 | -0.465 | -0.388 | -0.518 | -0.423 |
| 5.340707511102456 | -0.588 | -0.466 | -0.388 | -0.52 | -0.423 |
| 5.343849103756045 | -0.59 | -0.468 | -0.389 | -0.522 | -0.424 |
| 5.346990696409634 | -0.593 | -0.469 | -0.389 | -0.523 | -0.425 |
| 5.350132289063224 | -0.595 | -0.47 | -0.39 | -0.525 | -0.425 |
| 5.353273881716814 | -0.598 | -0.471 | -0.39 | -0.527 | -0.426 |
| 5.356415474370403 | -0.6 | -0.472 | -0.391 | -0.528 | -0.427 |
| 5.359557067023993 | -0.603 | -0.473 | -0.391 | -0.53 | -0.427 |
| 5.362698659677583 | -0.605 | -0.474 | -0.391 | -0.531 | -0.428 |
| 5.365840252331172 | -0.608 | -0.475 | -0.392 | -0.533 | -0.429 |
| 5.368981844984762 | -0.61 | -0.476 | -0.392 | -0.535 | -0.429 |
| 5.372123437638351 | -0.613 | -0.477 | -0.392 | -0.536 | -0.43 |
| 5.375265030291941 | -0.615 | -0.478 | -0.393 | -0.538 | -0.431 |
| 5.378406622945531 | -0.618 | -0.479 | -0.393 | -0.539 | -0.431 |
| 5.38154821559912 | -0.62 | -0.48 | -0.394 | -0.541 | -0.432 |
| 5.38468980825271 | -0.623 | -0.48 | -0.394 | -0.542 | -0.432 |
| 5.387831400906299 | -0.625 | -0.481 | -0.394 | -0.544 | -0.433 |
| 5.39097299355989 | -0.628 | -0.482 | -0.395 | -0.545 | -0.433 |
| 5.394114586213479 | -0.63 | -0.483 | -0.395 | -0.547 | -0.434 |
| 5.397256178867068 | -0.633 | -0.484 | -0.395 | -0.548 | -0.434 |
| 5.400397771520657 | -0.635 | -0.485 | -0.396 | -0.55 | -0.435 |
| 5.403539364174247 | -0.637 | -0.486 | -0.396 | -0.551 | -0.435 |
| 5.406680956827837 | -0.64 | -0.487 | -0.396 | -0.553 | -0.436 |
| 5.409822549481426 | -0.642 | -0.487 | -0.396 | -0.554 | -0.436 |
| 5.412964142135016 | -0.645 | -0.488 | -0.397 | -0.555 | -0.437 |
| 5.416105734788605 | -0.647 | -0.489 | -0.397 | -0.557 | -0.437 |
| 5.419247327442195 | -0.649 | -0.49 | -0.397 | -0.558 | -0.438 |
| 5.422388920095785 | -0.652 | -0.491 | -0.398 | -0.56 | -0.438 |
| 5.425530512749375 | -0.654 | -0.492 | -0.398 | -0.561 | -0.439 |
| 5.428672105402964 | -0.657 | -0.492 | -0.398 | -0.562 | -0.439 |
| 5.431813698056554 | -0.659 | -0.493 | -0.398 | -0.564 | -0.44 |
| 5.434955290710143 | -0.661 | -0.494 | -0.399 | -0.565 | -0.44 |
| 5.438096883363733 | -0.664 | -0.495 | -0.399 | -0.566 | -0.441 |
| 5.441238476017322 | -0.666 | -0.495 | -0.399 | -0.568 | -0.441 |
| 5.444380068670912 | -0.668 | -0.496 | -0.399 | -0.569 | -0.441 |
| 5.447521661324502 | -0.671 | -0.497 | -0.399 | -0.57 | -0.442 |
| 5.450663253978091 | -0.673 | -0.497 | -0.4 | -0.571 | -0.442 |
| 5.453804846631681 | -0.675 | -0.498 | -0.4 | -0.573 | -0.442 |
| 5.456946439285271 | -0.678 | -0.499 | -0.4 | -0.574 | -0.443 |
| 5.46008803193886 | -0.68 | -0.499 | -0.4 | -0.575 | -0.443 |
| 5.46322962459245 | -0.682 | -0.5 | -0.4 | -0.576 | -0.444 |
| 5.466371217246039 | -0.685 | -0.501 | -0.401 | -0.578 | -0.444 |
| 5.46951280989963 | -0.687 | -0.501 | -0.401 | -0.579 | -0.444 |
| 5.472654402553218 | -0.689 | -0.502 | -0.401 | -0.58 | -0.445 |
| 5.475795995206808 | -0.691 | -0.503 | -0.401 | -0.581 | -0.445 |
| 5.478937587860398 | -0.694 | -0.503 | -0.401 | -0.582 | -0.445 |
| 5.482079180513987 | -0.696 | -0.504 | -0.401 | -0.584 | -0.446 |
| 5.485220773167577 | -0.698 | -0.504 | -0.402 | -0.585 | -0.446 |
| 5.488362365821166 | -0.7 | -0.505 | -0.402 | -0.586 | -0.446 |
| 5.491503958474756 | -0.703 | -0.506 | -0.402 | -0.587 | -0.446 |
| 5.494645551128346 | -0.705 | -0.506 | -0.402 | -0.588 | -0.447 |
| 5.497787143781935 | -0.707 | -0.507 | -0.402 | -0.589 | -0.447 |
| 5.500928736435525 | -0.709 | -0.507 | -0.402 | -0.59 | -0.447 |
| 5.504070329089115 | -0.712 | -0.508 | -0.403 | -0.591 | -0.448 |
| 5.507211921742704 | -0.714 | -0.508 | -0.403 | -0.593 | -0.448 |
| 5.510353514396294 | -0.716 | -0.509 | -0.403 | -0.594 | -0.448 |
| 5.513495107049883 | -0.718 | -0.509 | -0.403 | -0.595 | -0.448 |
| 5.516636699703473 | -0.72 | -0.51 | -0.403 | -0.596 | -0.449 |
| 5.519778292357062 | -0.722 | -0.51 | -0.403 | -0.597 | -0.449 |
| 5.522919885010652 | -0.725 | -0.511 | -0.403 | -0.598 | -0.449 |
| 5.526061477664242 | -0.727 | -0.511 | -0.403 | -0.599 | -0.449 |
| 5.529203070317831 | -0.729 | -0.512 | -0.403 | -0.6 | -0.449 |
| 5.532344662971421 | -0.731 | -0.512 | -0.404 | -0.601 | -0.45 |
| 5.535486255625011 | -0.733 | -0.513 | -0.404 | -0.602 | -0.45 |
| 5.5386278482786 | -0.735 | -0.513 | -0.404 | -0.603 | -0.45 |
| 5.54176944093219 | -0.738 | -0.514 | -0.404 | -0.604 | -0.45 |
| 5.544911033585779 | -0.74 | -0.514 | -0.404 | -0.605 | -0.451 |
| 5.54805262623937 | -0.742 | -0.515 | -0.404 | -0.606 | -0.451 |
| 5.551194218892959 | -0.744 | -0.515 | -0.404 | -0.607 | -0.451 |
| 5.554335811546548 | -0.746 | -0.515 | -0.404 | -0.608 | -0.451 |
| 5.557477404200137 | -0.748 | -0.516 | -0.404 | -0.609 | -0.451 |
| 5.560618996853727 | -0.75 | -0.516 | -0.404 | -0.609 | -0.451 |
| 5.563760589507317 | -0.752 | -0.517 | -0.404 | -0.61 | -0.452 |
| 5.566902182160906 | -0.754 | -0.517 | -0.404 | -0.611 | -0.452 |
| 5.570043774814496 | -0.756 | -0.517 | -0.405 | -0.612 | -0.452 |
| 5.573185367468086 | -0.758 | -0.518 | -0.405 | -0.613 | -0.452 |
| 5.576326960121675 | -0.76 | -0.518 | -0.405 | -0.614 | -0.452 |
| 5.579468552775264 | -0.762 | -0.518 | -0.405 | -0.615 | -0.452 |
| 5.582610145428854 | -0.764 | -0.519 | -0.405 | -0.616 | -0.453 |
| 5.585751738082444 | -0.766 | -0.519 | -0.405 | -0.616 | -0.453 |
| 5.588893330736034 | -0.769 | -0.52 | -0.405 | -0.617 | -0.453 |
| 5.592034923389623 | -0.771 | -0.52 | -0.405 | -0.618 | -0.453 |
| 5.595176516043213 | -0.773 | -0.52 | -0.405 | -0.619 | -0.453 |
| 5.598318108696803 | -0.775 | -0.521 | -0.405 | -0.62 | -0.453 |
| 5.601459701350392 | -0.776 | -0.521 | -0.405 | -0.62 | -0.453 |
| 5.604601294003982 | -0.778 | -0.521 | -0.405 | -0.621 | -0.453 |
| 5.607742886657571 | -0.78 | -0.521 | -0.405 | -0.622 | -0.454 |
| 5.610884479311161 | -0.782 | -0.522 | -0.405 | -0.623 | -0.454 |
| 5.61402607196475 | -0.784 | -0.522 | -0.405 | -0.624 | -0.454 |
| 5.61716766461834 | -0.786 | -0.522 | -0.405 | -0.624 | -0.454 |
| 5.62030925727193 | -0.788 | -0.523 | -0.405 | -0.625 | -0.454 |
| 5.623450849925519 | -0.79 | -0.523 | -0.405 | -0.626 | -0.454 |
| 5.626592442579109 | -0.792 | -0.523 | -0.405 | -0.626 | -0.454 |
| 5.629734035232698 | -0.794 | -0.523 | -0.406 | -0.627 | -0.454 |
| 5.632875627886288 | -0.796 | -0.524 | -0.406 | -0.628 | -0.454 |
| 5.636017220539878 | -0.798 | -0.524 | -0.406 | -0.629 | -0.455 |
| 5.639158813193467 | -0.8 | -0.524 | -0.406 | -0.629 | -0.455 |
| 5.642300405847057 | -0.802 | -0.524 | -0.406 | -0.63 | -0.455 |
| 5.645441998500646 | -0.803 | -0.525 | -0.406 | -0.631 | -0.455 |
| 5.648583591154236 | -0.805 | -0.525 | -0.406 | -0.631 | -0.455 |
| 5.651725183807825 | -0.807 | -0.525 | -0.406 | -0.632 | -0.455 |
| 5.654866776461415 | -0.809 | -0.525 | -0.406 | -0.633 | -0.455 |
| 5.658008369115005 | -0.811 | -0.526 | -0.406 | -0.633 | -0.455 |
| 5.661149961768594 | -0.813 | -0.526 | -0.406 | -0.634 | -0.455 |
| 5.664291554422184 | -0.815 | -0.526 | -0.406 | -0.634 | -0.455 |
| 5.667433147075774 | -0.816 | -0.526 | -0.406 | -0.635 | -0.455 |
| 5.670574739729363 | -0.818 | -0.526 | -0.406 | -0.636 | -0.455 |
| 5.673716332382953 | -0.82 | -0.527 | -0.406 | -0.636 | -0.455 |
| 5.676857925036542 | -0.822 | -0.527 | -0.406 | -0.637 | -0.456 |
| 5.679999517690132 | -0.824 | -0.527 | -0.406 | -0.637 | -0.456 |
| 5.683141110343721 | -0.825 | -0.527 | -0.406 | -0.638 | -0.456 |
| 5.686282702997311 | -0.827 | -0.527 | -0.406 | -0.638 | -0.456 |
| 5.689424295650901 | -0.829 | -0.527 | -0.406 | -0.639 | -0.456 |
| 5.69256588830449 | -0.831 | -0.528 | -0.406 | -0.64 | -0.456 |
| 5.69570748095808 | -0.832 | -0.528 | -0.406 | -0.64 | -0.456 |
| 5.69884907361167 | -0.834 | -0.528 | -0.406 | -0.641 | -0.456 |
| 5.701990666265259 | -0.836 | -0.528 | -0.406 | -0.641 | -0.456 |
| 5.705132258918849 | -0.838 | -0.528 | -0.406 | -0.642 | -0.456 |
| 5.708273851572438 | -0.839 | -0.528 | -0.406 | -0.642 | -0.456 |
| 5.711415444226028 | -0.841 | -0.529 | -0.406 | -0.643 | -0.456 |
| 5.714557036879618 | -0.843 | -0.529 | -0.406 | -0.643 | -0.456 |
| 5.717698629533207 | -0.844 | -0.529 | -0.406 | -0.644 | -0.456 |
| 5.720840222186797 | -0.846 | -0.529 | -0.406 | -0.644 | -0.456 |
| 5.723981814840386 | -0.848 | -0.529 | -0.406 | -0.645 | -0.456 |
| 5.727123407493976 | -0.849 | -0.529 | -0.406 | -0.645 | -0.456 |
| 5.730265000147565 | -0.851 | -0.529 | -0.406 | -0.646 | -0.456 |
| 5.733406592801155 | -0.853 | -0.53 | -0.406 | -0.646 | -0.456 |
| 5.736548185454744 | -0.854 | -0.53 | -0.406 | -0.646 | -0.456 |
| 5.739689778108334 | -0.856 | -0.53 | -0.406 | -0.647 | -0.456 |
| 5.742831370761924 | -0.858 | -0.53 | -0.406 | -0.647 | -0.456 |
| 5.745972963415514 | -0.859 | -0.53 | -0.406 | -0.648 | -0.456 |
| 5.749114556069103 | -0.861 | -0.53 | -0.406 | -0.648 | -0.457 |
| 5.752256148722693 | -0.862 | -0.53 | -0.406 | -0.649 | -0.457 |
| 5.755397741376282 | -0.864 | -0.53 | -0.406 | -0.649 | -0.457 |
| 5.758539334029872 | -0.866 | -0.53 | -0.406 | -0.649 | -0.457 |
| 5.761680926683462 | -0.867 | -0.531 | -0.406 | -0.65 | -0.457 |
| 5.764822519337051 | -0.869 | -0.531 | -0.406 | -0.65 | -0.457 |
| 5.767964111990641 | -0.87 | -0.531 | -0.406 | -0.651 | -0.457 |
| 5.77110570464423 | -0.872 | -0.531 | -0.406 | -0.651 | -0.457 |
| 5.77424729729782 | -0.873 | -0.531 | -0.406 | -0.651 | -0.457 |
| 5.77738888995141 | -0.875 | -0.531 | -0.406 | -0.652 | -0.457 |
| 5.780530482605 | -0.876 | -0.531 | -0.406 | -0.652 | -0.457 |
| 5.783672075258588 | -0.878 | -0.531 | -0.406 | -0.652 | -0.457 |
| 5.786813667912178 | -0.879 | -0.531 | -0.406 | -0.653 | -0.457 |
| 5.789955260565768 | -0.881 | -0.531 | -0.406 | -0.653 | -0.457 |
| 5.793096853219358 | -0.882 | -0.531 | -0.406 | -0.653 | -0.457 |
| 5.796238445872947 | -0.884 | -0.531 | -0.406 | -0.654 | -0.457 |
| 5.799380038526537 | -0.885 | -0.531 | -0.406 | -0.654 | -0.457 |
| 5.802521631180126 | -0.887 | -0.532 | -0.406 | -0.654 | -0.457 |
| 5.805663223833715 | -0.888 | -0.532 | -0.406 | -0.655 | -0.457 |
| 5.808804816487306 | -0.89 | -0.532 | -0.406 | -0.655 | -0.457 |
| 5.811946409140895 | -0.891 | -0.532 | -0.406 | -0.655 | -0.457 |
| 5.815088001794485 | -0.892 | -0.532 | -0.406 | -0.656 | -0.457 |
| 5.818229594448074 | -0.894 | -0.532 | -0.406 | -0.656 | -0.457 |
| 5.821371187101663 | -0.895 | -0.532 | -0.406 | -0.656 | -0.457 |
| 5.824512779755254 | -0.897 | -0.532 | -0.406 | -0.656 | -0.457 |
| 5.827654372408843 | -0.898 | -0.532 | -0.406 | -0.657 | -0.457 |
| 5.830795965062433 | -0.899 | -0.532 | -0.406 | -0.657 | -0.457 |
| 5.833937557716022 | -0.901 | -0.532 | -0.406 | -0.657 | -0.457 |
| 5.837079150369612 | -0.902 | -0.532 | -0.406 | -0.657 | -0.457 |
| 5.840220743023201 | -0.903 | -0.532 | -0.406 | -0.658 | -0.457 |
| 5.843362335676791 | -0.905 | -0.532 | -0.406 | -0.658 | -0.457 |
| 5.846503928330381 | -0.906 | -0.532 | -0.406 | -0.658 | -0.457 |
| 5.84964552098397 | -0.907 | -0.532 | -0.406 | -0.658 | -0.457 |
| 5.85278711363756 | -0.909 | -0.532 | -0.406 | -0.659 | -0.457 |
| 5.85592870629115 | -0.91 | -0.532 | -0.406 | -0.659 | -0.457 |
| 5.85907029894474 | -0.911 | -0.532 | -0.406 | -0.659 | -0.457 |
| 5.862211891598329 | -0.913 | -0.533 | -0.406 | -0.659 | -0.457 |
| 5.865353484251918 | -0.914 | -0.533 | -0.406 | -0.659 | -0.457 |
| 5.868495076905508 | -0.915 | -0.533 | -0.406 | -0.66 | -0.457 |
| 5.871636669559098 | -0.917 | -0.533 | -0.406 | -0.66 | -0.457 |
| 5.874778262212687 | -0.918 | -0.533 | -0.406 | -0.66 | -0.457 |
| 5.877919854866277 | -0.919 | -0.533 | -0.406 | -0.66 | -0.457 |
| 5.881061447519866 | -0.92 | -0.533 | -0.406 | -0.66 | -0.457 |
| 5.884203040173456 | -0.921 | -0.533 | -0.406 | -0.661 | -0.457 |
| 5.887344632827046 | -0.923 | -0.533 | -0.406 | -0.661 | -0.457 |
| 5.890486225480635 | -0.924 | -0.533 | -0.406 | -0.661 | -0.457 |
| 5.893627818134224 | -0.925 | -0.533 | -0.406 | -0.661 | -0.457 |
| 5.896769410787814 | -0.926 | -0.533 | -0.406 | -0.661 | -0.457 |
| 5.899911003441404 | -0.927 | -0.533 | -0.406 | -0.662 | -0.457 |
| 5.903052596094994 | -0.929 | -0.533 | -0.406 | -0.662 | -0.457 |
| 5.906194188748583 | -0.93 | -0.533 | -0.406 | -0.662 | -0.457 |
| 5.909335781402172 | -0.931 | -0.533 | -0.406 | -0.662 | -0.457 |
| 5.912477374055762 | -0.932 | -0.533 | -0.406 | -0.662 | -0.457 |
| 5.915618966709352 | -0.933 | -0.533 | -0.406 | -0.662 | -0.457 |
| 5.918760559362942 | -0.934 | -0.533 | -0.406 | -0.662 | -0.457 |
| 5.921902152016531 | -0.935 | -0.533 | -0.406 | -0.663 | -0.457 |
| 5.92504374467012 | -0.937 | -0.533 | -0.406 | -0.663 | -0.457 |
| 5.92818533732371 | -0.938 | -0.533 | -0.406 | -0.663 | -0.457 |
| 5.9313269299773 | -0.939 | -0.533 | -0.406 | -0.663 | -0.457 |
| 5.93446852263089 | -0.94 | -0.533 | -0.406 | -0.663 | -0.457 |
| 5.93761011528448 | -0.941 | -0.533 | -0.406 | -0.663 | -0.457 |
| 5.940751707938068 | -0.942 | -0.533 | -0.406 | -0.663 | -0.457 |
| 5.943893300591658 | -0.943 | -0.533 | -0.406 | -0.663 | -0.457 |
| 5.947034893245248 | -0.944 | -0.533 | -0.406 | -0.664 | -0.457 |
| 5.950176485898837 | -0.945 | -0.533 | -0.406 | -0.664 | -0.457 |
| 5.953318078552427 | -0.946 | -0.533 | -0.406 | -0.664 | -0.457 |
| 5.956459671206017 | -0.947 | -0.533 | -0.406 | -0.664 | -0.457 |
| 5.959601263859606 | -0.948 | -0.533 | -0.406 | -0.664 | -0.457 |
| 5.962742856513196 | -0.949 | -0.533 | -0.406 | -0.664 | -0.457 |
| 5.965884449166785 | -0.95 | -0.533 | -0.406 | -0.664 | -0.457 |
| 5.969026041820375 | -0.951 | -0.533 | -0.406 | -0.664 | -0.457 |
| 5.972167634473964 | -0.952 | -0.533 | -0.406 | -0.664 | -0.457 |
| 5.975309227127554 | -0.953 | -0.533 | -0.406 | -0.664 | -0.457 |
| 5.978450819781144 | -0.954 | -0.533 | -0.406 | -0.665 | -0.457 |
| 5.981592412434733 | -0.955 | -0.533 | -0.406 | -0.665 | -0.457 |
| 5.984734005088323 | -0.956 | -0.533 | -0.406 | -0.665 | -0.457 |
| 5.987875597741913 | -0.957 | -0.533 | -0.406 | -0.665 | -0.457 |
| 5.991017190395502 | -0.958 | -0.533 | -0.406 | -0.665 | -0.457 |
| 5.994158783049092 | -0.959 | -0.533 | -0.406 | -0.665 | -0.457 |
| 5.997300375702681 | -0.959 | -0.533 | -0.406 | -0.665 | -0.457 |
| 6.000441968356271 | -0.96 | -0.533 | -0.406 | -0.665 | -0.457 |
| 6.003583561009861 | -0.961 | -0.533 | -0.406 | -0.665 | -0.457 |
| 6.00672515366345 | -0.962 | -0.533 | -0.406 | -0.665 | -0.457 |
| 6.00986674631704 | -0.963 | -0.533 | -0.406 | -0.665 | -0.457 |
| 6.01300833897063 | -0.964 | -0.533 | -0.406 | -0.665 | -0.457 |
| 6.01614993162422 | -0.965 | -0.533 | -0.406 | -0.665 | -0.457 |
| 6.019291524277808 | -0.965 | -0.533 | -0.406 | -0.665 | -0.457 |
| 6.022433116931398 | -0.966 | -0.533 | -0.406 | -0.666 | -0.457 |
| 6.025574709584988 | -0.967 | -0.533 | -0.406 | -0.666 | -0.457 |
| 6.028716302238577 | -0.968 | -0.533 | -0.406 | -0.666 | -0.457 |
| 6.031857894892167 | -0.969 | -0.533 | -0.406 | -0.666 | -0.457 |
| 6.034999487545757 | -0.969 | -0.533 | -0.406 | -0.666 | -0.457 |
| 6.038141080199346 | -0.97 | -0.533 | -0.406 | -0.666 | -0.457 |
| 6.041282672852935 | -0.971 | -0.533 | -0.406 | -0.666 | -0.457 |
| 6.044424265506525 | -0.972 | -0.533 | -0.406 | -0.666 | -0.457 |
| 6.047565858160115 | -0.972 | -0.533 | -0.406 | -0.666 | -0.457 |
| 6.050707450813704 | -0.973 | -0.533 | -0.406 | -0.666 | -0.457 |
| 6.053849043467294 | -0.974 | -0.533 | -0.406 | -0.666 | -0.457 |
| 6.056990636120884 | -0.975 | -0.533 | -0.406 | -0.666 | -0.457 |
| 6.060132228774473 | -0.975 | -0.533 | -0.406 | -0.666 | -0.457 |
| 6.063273821428063 | -0.976 | -0.533 | -0.406 | -0.666 | -0.457 |
| 6.066415414081653 | -0.977 | -0.533 | -0.406 | -0.666 | -0.457 |
| 6.069557006735242 | -0.977 | -0.533 | -0.406 | -0.666 | -0.457 |
| 6.072698599388831 | -0.978 | -0.533 | -0.406 | -0.666 | -0.457 |
| 6.07584019204242 | -0.979 | -0.533 | -0.406 | -0.666 | -0.457 |
| 6.078981784696011 | -0.979 | -0.533 | -0.406 | -0.666 | -0.457 |
| 6.082123377349601 | -0.98 | -0.533 | -0.406 | -0.666 | -0.457 |
| 6.08526497000319 | -0.98 | -0.533 | -0.406 | -0.666 | -0.457 |
| 6.08840656265678 | -0.981 | -0.533 | -0.406 | -0.666 | -0.457 |
| 6.09154815531037 | -0.982 | -0.533 | -0.406 | -0.666 | -0.457 |
| 6.094689747963959 | -0.982 | -0.533 | -0.406 | -0.666 | -0.457 |
| 6.097831340617549 | -0.983 | -0.533 | -0.406 | -0.666 | -0.457 |
| 6.100972933271138 | -0.983 | -0.533 | -0.406 | -0.666 | -0.457 |
| 6.104114525924728 | -0.984 | -0.533 | -0.406 | -0.666 | -0.457 |
| 6.107256118578317 | -0.985 | -0.533 | -0.406 | -0.666 | -0.457 |
| 6.110397711231907 | -0.985 | -0.533 | -0.406 | -0.666 | -0.457 |
| 6.113539303885497 | -0.986 | -0.533 | -0.406 | -0.666 | -0.457 |
| 6.116680896539086 | -0.986 | -0.533 | -0.406 | -0.666 | -0.457 |
| 6.119822489192675 | -0.987 | -0.533 | -0.406 | -0.666 | -0.457 |
| 6.122964081846265 | -0.987 | -0.533 | -0.406 | -0.667 | -0.457 |
| 6.126105674499855 | -0.988 | -0.533 | -0.406 | -0.667 | -0.457 |
| 6.129247267153445 | -0.988 | -0.533 | -0.406 | -0.667 | -0.457 |
| 6.132388859807034 | -0.989 | -0.533 | -0.406 | -0.667 | -0.457 |
| 6.135530452460624 | -0.989 | -0.533 | -0.406 | -0.667 | -0.457 |
| 6.138672045114213 | -0.99 | -0.533 | -0.406 | -0.667 | -0.457 |
| 6.141813637767803 | -0.99 | -0.533 | -0.406 | -0.667 | -0.457 |
| 6.144955230421393 | -0.99 | -0.533 | -0.406 | -0.667 | -0.457 |
| 6.148096823074982 | -0.991 | -0.533 | -0.406 | -0.667 | -0.457 |
| 6.151238415728571 | -0.991 | -0.533 | -0.406 | -0.667 | -0.457 |
| 6.154380008382161 | -0.992 | -0.533 | -0.406 | -0.667 | -0.457 |
| 6.157521601035751 | -0.992 | -0.533 | -0.406 | -0.667 | -0.457 |
| 6.16066319368934 | -0.993 | -0.533 | -0.406 | -0.667 | -0.457 |
| 6.16380478634293 | -0.993 | -0.533 | -0.406 | -0.667 | -0.457 |
| 6.16694637899652 | -0.993 | -0.533 | -0.406 | -0.667 | -0.457 |
| 6.170087971650109 | -0.994 | -0.533 | -0.406 | -0.667 | -0.457 |
| 6.173229564303698 | -0.994 | -0.533 | -0.406 | -0.667 | -0.457 |
| 6.176371156957289 | -0.994 | -0.533 | -0.406 | -0.667 | -0.457 |
| 6.179512749610878 | -0.995 | -0.533 | -0.406 | -0.667 | -0.457 |
| 6.182654342264468 | -0.995 | -0.533 | -0.406 | -0.667 | -0.457 |
| 6.185795934918057 | -0.995 | -0.533 | -0.406 | -0.667 | -0.457 |
| 6.188937527571647 | -0.996 | -0.533 | -0.406 | -0.667 | -0.457 |
| 6.192079120225237 | -0.996 | -0.533 | -0.406 | -0.667 | -0.457 |
| 6.195220712878826 | -0.996 | -0.533 | -0.406 | -0.667 | -0.457 |
| 6.198362305532415 | -0.996 | -0.533 | -0.406 | -0.667 | -0.457 |
| 6.201503898186005 | -0.997 | -0.533 | -0.406 | -0.667 | -0.457 |
| 6.204645490839594 | -0.997 | -0.533 | -0.406 | -0.667 | -0.457 |
| 6.207787083493184 | -0.997 | -0.533 | -0.406 | -0.667 | -0.457 |
| 6.210928676146774 | -0.997 | -0.533 | -0.406 | -0.667 | -0.457 |
| 6.214070268800364 | -0.998 | -0.533 | -0.406 | -0.667 | -0.457 |
| 6.217211861453953 | -0.998 | -0.533 | -0.406 | -0.667 | -0.457 |
| 6.220353454107543 | -0.998 | -0.533 | -0.406 | -0.667 | -0.457 |
| 6.223495046761133 | -0.998 | -0.533 | -0.406 | -0.667 | -0.457 |
| 6.226636639414722 | -0.998 | -0.533 | -0.406 | -0.667 | -0.457 |
| 6.229778232068312 | -0.999 | -0.533 | -0.406 | -0.667 | -0.457 |
| 6.232919824721901 | -0.999 | -0.533 | -0.406 | -0.667 | -0.457 |
| 6.236061417375491 | -0.999 | -0.533 | -0.406 | -0.667 | -0.457 |
| 6.23920301002908 | -0.999 | -0.533 | -0.406 | -0.667 | -0.457 |
| 6.24234460268267 | -0.999 | -0.533 | -0.406 | -0.667 | -0.457 |
| 6.24548619533626 | -0.999 | -0.533 | -0.406 | -0.667 | -0.457 |
| 6.24862778798985 | -0.999 | -0.533 | -0.406 | -0.667 | -0.457 |
| 6.251769380643438 | -1 | -0.533 | -0.406 | -0.667 | -0.457 |
| 6.254910973297028 | -1 | -0.533 | -0.406 | -0.667 | -0.457 |
| 6.258052565950618 | -1 | -0.533 | -0.406 | -0.667 | -0.457 |
| 6.261194158604208 | -1 | -0.533 | -0.406 | -0.667 | -0.457 |
| 6.264335751257797 | -1 | -0.533 | -0.406 | -0.667 | -0.457 |
| 6.267477343911387 | -1 | -0.533 | -0.406 | -0.667 | -0.457 |
| 6.270618936564976 | -1 | -0.533 | -0.406 | -0.667 | -0.457 |
| 6.273760529218566 | -1 | -0.533 | -0.406 | -0.667 | -0.457 |
| 6.276902121872155 | -1 | -0.533 | -0.406 | -0.667 | -0.457 |
| 6.280043714525745 | -1 | -0.533 | -0.406 | -0.667 | -0.457 |
| 6.283185307179335 | -1 | -0.533 | -0.406 | -0.667 | -0.457 |